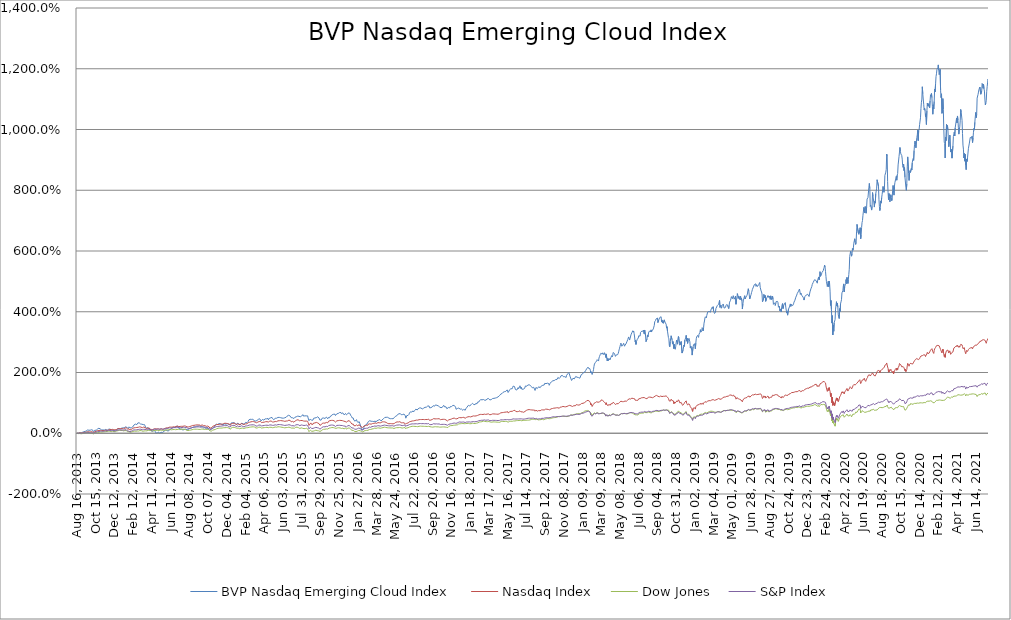
| Category | BVP Nasdaq Emerging Cloud Index | Nasdaq Index | Dow Jones | S&P Index |
|---|---|---|---|---|
| Aug 16, 2013 | 0 | 0 | 0 | 0 |
| Aug 19, 2013 | -0.007 | -0.004 | -0.005 | -0.006 |
| Aug 20, 2013 | 0.005 | 0.003 | -0.005 | -0.002 |
| Aug 21, 2013 | 0.004 | -0.001 | -0.012 | -0.008 |
| Aug 22, 2013 | 0.009 | 0.01 | -0.008 | 0.001 |
| Aug 23, 2013 | 0.012 | 0.015 | -0.005 | 0.005 |
| Aug 26, 2013 | 0.017 | 0.015 | -0.009 | 0.001 |
| Aug 27, 2013 | -0.004 | -0.007 | -0.02 | -0.015 |
| Aug 28, 2013 | -0.003 | -0.003 | -0.017 | -0.013 |
| Aug 29, 2013 | 0.009 | 0.005 | -0.016 | -0.011 |
| Aug 30, 2013 | 0.016 | -0.004 | -0.018 | -0.014 |
| Sep 03, 2013 | 0.029 | 0.003 | -0.016 | -0.01 |
| Sep 04, 2013 | 0.032 | 0.013 | -0.01 | -0.002 |
| Sep 05, 2013 | 0.032 | 0.016 | -0.01 | 0 |
| Sep 06, 2013 | 0.029 | 0.016 | -0.011 | 0 |
| Sep 09, 2013 | 0.05 | 0.029 | -0.001 | 0.01 |
| Sep 10, 2013 | 0.071 | 0.035 | 0.007 | 0.017 |
| Sep 11, 2013 | 0.068 | 0.034 | 0.016 | 0.02 |
| Sep 12, 2013 | 0.062 | 0.031 | 0.015 | 0.017 |
| Sep 13, 2013 | 0.07 | 0.033 | 0.02 | 0.019 |
| Sep 16, 2013 | 0.065 | 0.032 | 0.027 | 0.025 |
| Sep 17, 2013 | 0.078 | 0.04 | 0.03 | 0.03 |
| Sep 18, 2013 | 0.108 | 0.05 | 0.039 | 0.042 |
| Sep 19, 2013 | 0.112 | 0.052 | 0.037 | 0.04 |
| Sep 20, 2013 | 0.113 | 0.048 | 0.025 | 0.033 |
| Sep 23, 2013 | 0.106 | 0.045 | 0.021 | 0.028 |
| Sep 24, 2013 | 0.097 | 0.046 | 0.017 | 0.025 |
| Sep 25, 2013 | 0.093 | 0.044 | 0.013 | 0.022 |
| Sep 26, 2013 | 0.104 | 0.051 | 0.016 | 0.026 |
| Sep 27, 2013 | 0.101 | 0.05 | 0.012 | 0.022 |
| Sep 30, 2013 | 0.105 | 0.047 | 0.003 | 0.016 |
| Oct 01, 2013 | 0.119 | 0.06 | 0.007 | 0.024 |
| Oct 02, 2013 | 0.116 | 0.059 | 0.003 | 0.023 |
| Oct 03, 2013 | 0.098 | 0.048 | -0.006 | 0.014 |
| Oct 04, 2013 | 0.115 | 0.057 | -0.001 | 0.021 |
| Oct 07, 2013 | 0.096 | 0.047 | -0.01 | 0.012 |
| Oct 08, 2013 | 0.054 | 0.026 | -0.02 | 0 |
| Oct 09, 2013 | 0.046 | 0.021 | -0.018 | 0 |
| Oct 10, 2013 | 0.085 | 0.044 | 0.003 | 0.022 |
| Oct 11, 2013 | 0.098 | 0.052 | 0.01 | 0.029 |
| Oct 14, 2013 | 0.108 | 0.059 | 0.015 | 0.033 |
| Oct 15, 2013 | 0.087 | 0.053 | 0.006 | 0.026 |
| Oct 16, 2013 | 0.098 | 0.066 | 0.019 | 0.04 |
| Oct 17, 2013 | 0.106 | 0.072 | 0.019 | 0.047 |
| Oct 18, 2013 | 0.125 | 0.086 | 0.021 | 0.054 |
| Oct 21, 2013 | 0.14 | 0.088 | 0.021 | 0.054 |
| Oct 22, 2013 | 0.133 | 0.091 | 0.026 | 0.06 |
| Oct 23, 2013 | 0.122 | 0.084 | 0.022 | 0.055 |
| Oct 24, 2013 | 0.167 | 0.091 | 0.028 | 0.058 |
| Oct 25, 2013 | 0.163 | 0.095 | 0.032 | 0.063 |
| Oct 28, 2013 | 0.147 | 0.094 | 0.032 | 0.064 |
| Oct 29, 2013 | 0.142 | 0.097 | 0.04 | 0.07 |
| Oct 30, 2013 | 0.125 | 0.091 | 0.036 | 0.065 |
| Oct 31, 2013 | 0.136 | 0.088 | 0.031 | 0.061 |
| Nov 01, 2013 | 0.11 | 0.089 | 0.035 | 0.064 |
| Nov 04, 2013 | 0.121 | 0.093 | 0.037 | 0.068 |
| Nov 05, 2013 | 0.123 | 0.094 | 0.036 | 0.065 |
| Nov 06, 2013 | 0.107 | 0.091 | 0.044 | 0.069 |
| Nov 07, 2013 | 0.076 | 0.071 | 0.034 | 0.055 |
| Nov 08, 2013 | 0.108 | 0.088 | 0.045 | 0.069 |
| Nov 11, 2013 | 0.108 | 0.088 | 0.047 | 0.07 |
| Nov 12, 2013 | 0.124 | 0.088 | 0.044 | 0.068 |
| Nov 13, 2013 | 0.137 | 0.101 | 0.049 | 0.076 |
| Nov 14, 2013 | 0.125 | 0.103 | 0.053 | 0.081 |
| Nov 15, 2013 | 0.139 | 0.106 | 0.058 | 0.086 |
| Nov 18, 2013 | 0.114 | 0.096 | 0.059 | 0.082 |
| Nov 19, 2013 | 0.1 | 0.091 | 0.059 | 0.08 |
| Nov 20, 2013 | 0.097 | 0.088 | 0.054 | 0.076 |
| Nov 21, 2013 | 0.12 | 0.102 | 0.062 | 0.085 |
| Nov 22, 2013 | 0.13 | 0.108 | 0.065 | 0.09 |
| Nov 25, 2013 | 0.117 | 0.109 | 0.066 | 0.089 |
| Nov 26, 2013 | 0.139 | 0.115 | 0.066 | 0.089 |
| Nov 27, 2013 | 0.137 | 0.123 | 0.067 | 0.091 |
| Nov 29, 2013 | 0.134 | 0.127 | 0.067 | 0.091 |
| Dec 02, 2013 | 0.122 | 0.123 | 0.061 | 0.088 |
| Dec 03, 2013 | 0.113 | 0.121 | 0.055 | 0.084 |
| Dec 04, 2013 | 0.108 | 0.121 | 0.054 | 0.083 |
| Dec 05, 2013 | 0.111 | 0.119 | 0.049 | 0.078 |
| Dec 06, 2013 | 0.108 | 0.128 | 0.062 | 0.09 |
| Dec 09, 2013 | 0.106 | 0.129 | 0.063 | 0.092 |
| Dec 10, 2013 | 0.098 | 0.127 | 0.059 | 0.089 |
| Dec 11, 2013 | 0.074 | 0.111 | 0.051 | 0.076 |
| Dec 12, 2013 | 0.068 | 0.11 | 0.044 | 0.072 |
| Dec 13, 2013 | 0.096 | 0.111 | 0.045 | 0.072 |
| Dec 16, 2013 | 0.098 | 0.118 | 0.053 | 0.079 |
| Dec 17, 2013 | 0.102 | 0.117 | 0.053 | 0.076 |
| Dec 18, 2013 | 0.114 | 0.13 | 0.072 | 0.094 |
| Dec 19, 2013 | 0.108 | 0.126 | 0.073 | 0.093 |
| Dec 20, 2013 | 0.14 | 0.139 | 0.076 | 0.098 |
| Dec 23, 2013 | 0.151 | 0.152 | 0.08 | 0.104 |
| Dec 24, 2013 | 0.151 | 0.153 | 0.085 | 0.107 |
| Dec 26, 2013 | 0.15 | 0.157 | 0.093 | 0.112 |
| Dec 27, 2013 | 0.152 | 0.154 | 0.093 | 0.112 |
| Dec 30, 2013 | 0.158 | 0.153 | 0.094 | 0.112 |
| Dec 31, 2013 | 0.163 | 0.159 | 0.099 | 0.116 |
| Jan 02, 2014 | 0.144 | 0.15 | 0.09 | 0.106 |
| Jan 03, 2014 | 0.155 | 0.147 | 0.092 | 0.106 |
| Jan 06, 2014 | 0.148 | 0.142 | 0.089 | 0.103 |
| Jan 07, 2014 | 0.17 | 0.153 | 0.096 | 0.11 |
| Jan 08, 2014 | 0.179 | 0.156 | 0.092 | 0.11 |
| Jan 09, 2014 | 0.17 | 0.154 | 0.09 | 0.11 |
| Jan 10, 2014 | 0.175 | 0.159 | 0.09 | 0.113 |
| Jan 13, 2014 | 0.144 | 0.142 | 0.078 | 0.099 |
| Jan 14, 2014 | 0.165 | 0.161 | 0.086 | 0.111 |
| Jan 15, 2014 | 0.189 | 0.17 | 0.093 | 0.116 |
| Jan 16, 2014 | 0.204 | 0.171 | 0.089 | 0.115 |
| Jan 17, 2014 | 0.206 | 0.165 | 0.091 | 0.11 |
| Jan 21, 2014 | 0.213 | 0.173 | 0.088 | 0.114 |
| Jan 22, 2014 | 0.225 | 0.178 | 0.086 | 0.114 |
| Jan 23, 2014 | 0.216 | 0.171 | 0.074 | 0.104 |
| Jan 24, 2014 | 0.18 | 0.146 | 0.053 | 0.081 |
| Jan 27, 2014 | 0.162 | 0.133 | 0.05 | 0.076 |
| Jan 28, 2014 | 0.18 | 0.137 | 0.056 | 0.083 |
| Jan 29, 2014 | 0.161 | 0.125 | 0.044 | 0.071 |
| Jan 30, 2014 | 0.211 | 0.144 | 0.051 | 0.084 |
| Jan 31, 2014 | 0.217 | 0.139 | 0.041 | 0.077 |
| Feb 03, 2014 | 0.176 | 0.109 | 0.019 | 0.052 |
| Feb 04, 2014 | 0.181 | 0.119 | 0.024 | 0.06 |
| Feb 05, 2014 | 0.176 | 0.113 | 0.024 | 0.058 |
| Feb 06, 2014 | 0.179 | 0.126 | 0.036 | 0.071 |
| Feb 07, 2014 | 0.192 | 0.145 | 0.047 | 0.085 |
| Feb 10, 2014 | 0.198 | 0.151 | 0.048 | 0.087 |
| Feb 11, 2014 | 0.208 | 0.163 | 0.061 | 0.099 |
| Feb 12, 2014 | 0.216 | 0.166 | 0.059 | 0.099 |
| Feb 13, 2014 | 0.239 | 0.177 | 0.063 | 0.105 |
| Feb 14, 2014 | 0.277 | 0.178 | 0.071 | 0.11 |
| Feb 18, 2014 | 0.291 | 0.186 | 0.07 | 0.112 |
| Feb 19, 2014 | 0.282 | 0.176 | 0.064 | 0.104 |
| Feb 20, 2014 | 0.301 | 0.185 | 0.07 | 0.111 |
| Feb 21, 2014 | 0.313 | 0.183 | 0.068 | 0.109 |
| Feb 24, 2014 | 0.315 | 0.192 | 0.075 | 0.116 |
| Feb 25, 2014 | 0.284 | 0.19 | 0.073 | 0.114 |
| Feb 26, 2014 | 0.293 | 0.191 | 0.074 | 0.114 |
| Feb 27, 2014 | 0.336 | 0.199 | 0.079 | 0.12 |
| Feb 28, 2014 | 0.309 | 0.196 | 0.082 | 0.123 |
| Mar 03, 2014 | 0.304 | 0.187 | 0.072 | 0.115 |
| Mar 04, 2014 | 0.346 | 0.208 | 0.087 | 0.132 |
| Mar 05, 2014 | 0.34 | 0.21 | 0.085 | 0.132 |
| Mar 06, 2014 | 0.323 | 0.208 | 0.089 | 0.134 |
| Mar 07, 2014 | 0.305 | 0.204 | 0.091 | 0.134 |
| Mar 10, 2014 | 0.299 | 0.203 | 0.089 | 0.134 |
| Mar 11, 2014 | 0.286 | 0.196 | 0.084 | 0.128 |
| Mar 12, 2014 | 0.298 | 0.2 | 0.083 | 0.128 |
| Mar 13, 2014 | 0.274 | 0.183 | 0.068 | 0.115 |
| Mar 14, 2014 | 0.274 | 0.178 | 0.065 | 0.112 |
| Mar 17, 2014 | 0.285 | 0.188 | 0.077 | 0.123 |
| Mar 18, 2014 | 0.312 | 0.203 | 0.083 | 0.131 |
| Mar 19, 2014 | 0.287 | 0.196 | 0.076 | 0.124 |
| Mar 20, 2014 | 0.281 | 0.199 | 0.083 | 0.131 |
| Mar 21, 2014 | 0.243 | 0.187 | 0.081 | 0.127 |
| Mar 24, 2014 | 0.205 | 0.173 | 0.079 | 0.122 |
| Mar 25, 2014 | 0.194 | 0.175 | 0.085 | 0.127 |
| Mar 26, 2014 | 0.164 | 0.158 | 0.079 | 0.119 |
| Mar 27, 2014 | 0.171 | 0.152 | 0.078 | 0.117 |
| Mar 28, 2014 | 0.16 | 0.153 | 0.082 | 0.122 |
| Mar 31, 2014 | 0.189 | 0.165 | 0.091 | 0.131 |
| Apr 01, 2014 | 0.204 | 0.185 | 0.096 | 0.139 |
| Apr 02, 2014 | 0.19 | 0.187 | 0.099 | 0.142 |
| Apr 03, 2014 | 0.138 | 0.176 | 0.099 | 0.141 |
| Apr 04, 2014 | 0.102 | 0.146 | 0.088 | 0.126 |
| Apr 07, 2014 | 0.075 | 0.132 | 0.077 | 0.114 |
| Apr 08, 2014 | 0.095 | 0.142 | 0.078 | 0.118 |
| Apr 09, 2014 | 0.127 | 0.161 | 0.09 | 0.131 |
| Apr 10, 2014 | 0.07 | 0.125 | 0.072 | 0.107 |
| Apr 11, 2014 | 0.041 | 0.11 | 0.063 | 0.097 |
| Apr 14, 2014 | 0.045 | 0.117 | 0.072 | 0.106 |
| Apr 15, 2014 | 0.067 | 0.12 | 0.078 | 0.113 |
| Apr 16, 2014 | 0.083 | 0.134 | 0.089 | 0.125 |
| Apr 17, 2014 | 0.096 | 0.137 | 0.088 | 0.126 |
| Apr 21, 2014 | 0.094 | 0.144 | 0.091 | 0.13 |
| Apr 22, 2014 | 0.096 | 0.155 | 0.095 | 0.135 |
| Apr 23, 2014 | 0.075 | 0.145 | 0.094 | 0.133 |
| Apr 24, 2014 | 0.042 | 0.151 | 0.094 | 0.135 |
| Apr 25, 2014 | -0.003 | 0.131 | 0.085 | 0.125 |
| Apr 28, 2014 | -0.028 | 0.131 | 0.091 | 0.129 |
| Apr 29, 2014 | -0.003 | 0.139 | 0.096 | 0.134 |
| Apr 30, 2014 | 0.016 | 0.142 | 0.099 | 0.138 |
| May 01, 2014 | 0.031 | 0.146 | 0.098 | 0.138 |
| May 02, 2014 | 0.04 | 0.145 | 0.095 | 0.136 |
| May 05, 2014 | 0.041 | 0.149 | 0.096 | 0.138 |
| May 06, 2014 | 0.009 | 0.133 | 0.087 | 0.128 |
| May 07, 2014 | -0.021 | 0.129 | 0.095 | 0.134 |
| May 08, 2014 | -0.023 | 0.125 | 0.097 | 0.133 |
| May 09, 2014 | -0.002 | 0.13 | 0.1 | 0.134 |
| May 12, 2014 | 0.041 | 0.15 | 0.107 | 0.145 |
| May 13, 2014 | 0.026 | 0.146 | 0.108 | 0.146 |
| May 14, 2014 | 0.01 | 0.138 | 0.102 | 0.141 |
| May 15, 2014 | 0.009 | 0.129 | 0.091 | 0.13 |
| May 16, 2014 | 0.026 | 0.135 | 0.093 | 0.134 |
| May 19, 2014 | 0.053 | 0.145 | 0.095 | 0.138 |
| May 20, 2014 | 0.054 | 0.137 | 0.086 | 0.131 |
| May 21, 2014 | 0.055 | 0.147 | 0.096 | 0.14 |
| May 22, 2014 | 0.076 | 0.153 | 0.097 | 0.143 |
| May 23, 2014 | 0.094 | 0.162 | 0.101 | 0.148 |
| May 27, 2014 | 0.116 | 0.176 | 0.106 | 0.155 |
| May 28, 2014 | 0.108 | 0.173 | 0.103 | 0.153 |
| May 29, 2014 | 0.113 | 0.179 | 0.107 | 0.16 |
| May 30, 2014 | 0.089 | 0.178 | 0.108 | 0.162 |
| Jun 02, 2014 | 0.069 | 0.176 | 0.11 | 0.163 |
| Jun 03, 2014 | 0.066 | 0.175 | 0.109 | 0.162 |
| Jun 04, 2014 | 0.071 | 0.18 | 0.11 | 0.164 |
| Jun 05, 2014 | 0.101 | 0.192 | 0.116 | 0.172 |
| Jun 06, 2014 | 0.113 | 0.199 | 0.122 | 0.177 |
| Jun 09, 2014 | 0.115 | 0.204 | 0.123 | 0.178 |
| Jun 10, 2014 | 0.114 | 0.204 | 0.124 | 0.178 |
| Jun 11, 2014 | 0.124 | 0.202 | 0.117 | 0.174 |
| Jun 12, 2014 | 0.128 | 0.193 | 0.11 | 0.166 |
| Jun 13, 2014 | 0.141 | 0.196 | 0.112 | 0.169 |
| Jun 16, 2014 | 0.167 | 0.199 | 0.113 | 0.17 |
| Jun 17, 2014 | 0.18 | 0.204 | 0.115 | 0.173 |
| Jun 18, 2014 | 0.199 | 0.211 | 0.121 | 0.182 |
| Jun 19, 2014 | 0.197 | 0.21 | 0.122 | 0.183 |
| Jun 20, 2014 | 0.197 | 0.212 | 0.124 | 0.185 |
| Jun 23, 2014 | 0.2 | 0.213 | 0.123 | 0.185 |
| Jun 24, 2014 | 0.193 | 0.208 | 0.115 | 0.178 |
| Jun 25, 2014 | 0.199 | 0.216 | 0.118 | 0.183 |
| Jun 26, 2014 | 0.198 | 0.215 | 0.117 | 0.182 |
| Jun 27, 2014 | 0.209 | 0.221 | 0.117 | 0.184 |
| Jun 30, 2014 | 0.218 | 0.224 | 0.116 | 0.184 |
| Jul 01, 2014 | 0.244 | 0.238 | 0.124 | 0.192 |
| Jul 02, 2014 | 0.227 | 0.237 | 0.126 | 0.193 |
| Jul 03, 2014 | 0.226 | 0.245 | 0.132 | 0.199 |
| Jul 07, 2014 | 0.197 | 0.236 | 0.129 | 0.194 |
| Jul 08, 2014 | 0.158 | 0.219 | 0.121 | 0.186 |
| Jul 09, 2014 | 0.151 | 0.227 | 0.126 | 0.191 |
| Jul 10, 2014 | 0.145 | 0.22 | 0.122 | 0.187 |
| Jul 11, 2014 | 0.143 | 0.226 | 0.123 | 0.188 |
| Jul 14, 2014 | 0.152 | 0.232 | 0.131 | 0.194 |
| Jul 15, 2014 | 0.135 | 0.226 | 0.131 | 0.192 |
| Jul 16, 2014 | 0.135 | 0.228 | 0.136 | 0.197 |
| Jul 17, 2014 | 0.113 | 0.211 | 0.126 | 0.183 |
| Jul 18, 2014 | 0.106 | 0.23 | 0.134 | 0.195 |
| Jul 21, 2014 | 0.105 | 0.228 | 0.131 | 0.192 |
| Jul 22, 2014 | 0.115 | 0.237 | 0.135 | 0.198 |
| Jul 23, 2014 | 0.111 | 0.242 | 0.133 | 0.2 |
| Jul 24, 2014 | 0.126 | 0.241 | 0.133 | 0.201 |
| Jul 25, 2014 | 0.131 | 0.235 | 0.125 | 0.195 |
| Jul 28, 2014 | 0.118 | 0.234 | 0.126 | 0.195 |
| Jul 29, 2014 | 0.137 | 0.233 | 0.121 | 0.19 |
| Jul 30, 2014 | 0.163 | 0.239 | 0.119 | 0.19 |
| Jul 31, 2014 | 0.123 | 0.213 | 0.098 | 0.166 |
| Aug 01, 2014 | 0.109 | 0.208 | 0.094 | 0.163 |
| Aug 04, 2014 | 0.133 | 0.217 | 0.099 | 0.171 |
| Aug 05, 2014 | 0.128 | 0.208 | 0.089 | 0.16 |
| Aug 06, 2014 | 0.128 | 0.209 | 0.09 | 0.16 |
| Aug 07, 2014 | 0.128 | 0.203 | 0.085 | 0.153 |
| Aug 08, 2014 | 0.137 | 0.213 | 0.098 | 0.167 |
| Aug 11, 2014 | 0.158 | 0.222 | 0.099 | 0.17 |
| Aug 12, 2014 | 0.157 | 0.218 | 0.098 | 0.168 |
| Aug 13, 2014 | 0.173 | 0.231 | 0.104 | 0.176 |
| Aug 14, 2014 | 0.17 | 0.236 | 0.108 | 0.181 |
| Aug 15, 2014 | 0.161 | 0.239 | 0.105 | 0.181 |
| Aug 18, 2014 | 0.181 | 0.251 | 0.117 | 0.191 |
| Aug 19, 2014 | 0.189 | 0.257 | 0.122 | 0.197 |
| Aug 20, 2014 | 0.176 | 0.256 | 0.126 | 0.2 |
| Aug 21, 2014 | 0.182 | 0.258 | 0.13 | 0.203 |
| Aug 22, 2014 | 0.2 | 0.26 | 0.127 | 0.201 |
| Aug 25, 2014 | 0.195 | 0.265 | 0.132 | 0.207 |
| Aug 26, 2014 | 0.213 | 0.269 | 0.134 | 0.208 |
| Aug 27, 2014 | 0.206 | 0.268 | 0.135 | 0.208 |
| Aug 28, 2014 | 0.189 | 0.265 | 0.132 | 0.206 |
| Aug 29, 2014 | 0.233 | 0.271 | 0.134 | 0.21 |
| Sep 02, 2014 | 0.235 | 0.276 | 0.132 | 0.209 |
| Sep 03, 2014 | 0.223 | 0.269 | 0.132 | 0.208 |
| Sep 04, 2014 | 0.227 | 0.266 | 0.132 | 0.206 |
| Sep 05, 2014 | 0.23 | 0.272 | 0.136 | 0.213 |
| Sep 08, 2014 | 0.251 | 0.275 | 0.135 | 0.209 |
| Sep 09, 2014 | 0.228 | 0.264 | 0.128 | 0.201 |
| Sep 10, 2014 | 0.246 | 0.273 | 0.132 | 0.205 |
| Sep 11, 2014 | 0.261 | 0.275 | 0.13 | 0.206 |
| Sep 12, 2014 | 0.246 | 0.268 | 0.126 | 0.199 |
| Sep 15, 2014 | 0.208 | 0.254 | 0.129 | 0.198 |
| Sep 16, 2014 | 0.207 | 0.264 | 0.136 | 0.207 |
| Sep 17, 2014 | 0.207 | 0.266 | 0.138 | 0.209 |
| Sep 18, 2014 | 0.216 | 0.275 | 0.145 | 0.215 |
| Sep 19, 2014 | 0.213 | 0.271 | 0.146 | 0.214 |
| Sep 22, 2014 | 0.191 | 0.257 | 0.139 | 0.204 |
| Sep 23, 2014 | 0.176 | 0.251 | 0.131 | 0.197 |
| Sep 24, 2014 | 0.198 | 0.264 | 0.141 | 0.207 |
| Sep 25, 2014 | 0.17 | 0.24 | 0.124 | 0.187 |
| Sep 26, 2014 | 0.181 | 0.252 | 0.135 | 0.197 |
| Sep 29, 2014 | 0.191 | 0.251 | 0.132 | 0.194 |
| Sep 30, 2014 | 0.178 | 0.247 | 0.13 | 0.191 |
| Oct 01, 2014 | 0.156 | 0.227 | 0.114 | 0.175 |
| Oct 02, 2014 | 0.174 | 0.23 | 0.114 | 0.175 |
| Oct 03, 2014 | 0.202 | 0.242 | 0.128 | 0.188 |
| Oct 06, 2014 | 0.181 | 0.236 | 0.127 | 0.187 |
| Oct 07, 2014 | 0.146 | 0.217 | 0.109 | 0.169 |
| Oct 08, 2014 | 0.173 | 0.24 | 0.127 | 0.189 |
| Oct 09, 2014 | 0.141 | 0.215 | 0.105 | 0.164 |
| Oct 10, 2014 | 0.107 | 0.187 | 0.097 | 0.151 |
| Oct 13, 2014 | 0.091 | 0.17 | 0.082 | 0.132 |
| Oct 14, 2014 | 0.103 | 0.173 | 0.082 | 0.134 |
| Oct 15, 2014 | 0.129 | 0.17 | 0.07 | 0.125 |
| Oct 16, 2014 | 0.147 | 0.171 | 0.069 | 0.125 |
| Oct 17, 2014 | 0.156 | 0.182 | 0.086 | 0.139 |
| Oct 20, 2014 | 0.164 | 0.198 | 0.087 | 0.15 |
| Oct 21, 2014 | 0.181 | 0.227 | 0.102 | 0.172 |
| Oct 22, 2014 | 0.152 | 0.217 | 0.091 | 0.164 |
| Oct 23, 2014 | 0.188 | 0.236 | 0.106 | 0.178 |
| Oct 24, 2014 | 0.218 | 0.245 | 0.114 | 0.186 |
| Oct 27, 2014 | 0.217 | 0.245 | 0.115 | 0.185 |
| Oct 28, 2014 | 0.249 | 0.267 | 0.128 | 0.199 |
| Oct 29, 2014 | 0.238 | 0.263 | 0.126 | 0.197 |
| Oct 30, 2014 | 0.258 | 0.267 | 0.14 | 0.205 |
| Oct 31, 2014 | 0.303 | 0.285 | 0.153 | 0.219 |
| Nov 03, 2014 | 0.295 | 0.288 | 0.151 | 0.219 |
| Nov 04, 2014 | 0.296 | 0.283 | 0.153 | 0.215 |
| Nov 05, 2014 | 0.289 | 0.283 | 0.159 | 0.222 |
| Nov 06, 2014 | 0.296 | 0.287 | 0.164 | 0.227 |
| Nov 07, 2014 | 0.312 | 0.286 | 0.165 | 0.227 |
| Nov 10, 2014 | 0.318 | 0.291 | 0.168 | 0.231 |
| Nov 11, 2014 | 0.324 | 0.294 | 0.168 | 0.232 |
| Nov 12, 2014 | 0.326 | 0.298 | 0.168 | 0.231 |
| Nov 13, 2014 | 0.313 | 0.299 | 0.17 | 0.232 |
| Nov 14, 2014 | 0.317 | 0.301 | 0.169 | 0.232 |
| Nov 17, 2014 | 0.291 | 0.296 | 0.17 | 0.233 |
| Nov 18, 2014 | 0.29 | 0.305 | 0.173 | 0.239 |
| Nov 19, 2014 | 0.268 | 0.298 | 0.173 | 0.237 |
| Nov 20, 2014 | 0.276 | 0.305 | 0.175 | 0.24 |
| Nov 21, 2014 | 0.28 | 0.308 | 0.181 | 0.246 |
| Nov 24, 2014 | 0.292 | 0.32 | 0.181 | 0.25 |
| Nov 25, 2014 | 0.288 | 0.321 | 0.181 | 0.248 |
| Nov 26, 2014 | 0.309 | 0.329 | 0.182 | 0.252 |
| Nov 28, 2014 | 0.305 | 0.33 | 0.182 | 0.249 |
| Dec 01, 2014 | 0.286 | 0.312 | 0.179 | 0.24 |
| Dec 02, 2014 | 0.299 | 0.32 | 0.186 | 0.248 |
| Dec 03, 2014 | 0.301 | 0.325 | 0.188 | 0.253 |
| Dec 04, 2014 | 0.309 | 0.324 | 0.187 | 0.251 |
| Dec 05, 2014 | 0.319 | 0.327 | 0.191 | 0.253 |
| Dec 08, 2014 | 0.296 | 0.316 | 0.184 | 0.244 |
| Dec 09, 2014 | 0.315 | 0.323 | 0.18 | 0.244 |
| Dec 10, 2014 | 0.287 | 0.3 | 0.163 | 0.224 |
| Dec 11, 2014 | 0.288 | 0.307 | 0.167 | 0.229 |
| Dec 12, 2014 | 0.286 | 0.292 | 0.146 | 0.209 |
| Dec 15, 2014 | 0.278 | 0.278 | 0.139 | 0.202 |
| Dec 16, 2014 | 0.259 | 0.262 | 0.132 | 0.191 |
| Dec 17, 2014 | 0.3 | 0.289 | 0.151 | 0.216 |
| Dec 18, 2014 | 0.342 | 0.318 | 0.179 | 0.245 |
| Dec 19, 2014 | 0.346 | 0.323 | 0.181 | 0.251 |
| Dec 22, 2014 | 0.347 | 0.327 | 0.191 | 0.255 |
| Dec 23, 2014 | 0.348 | 0.323 | 0.195 | 0.257 |
| Dec 24, 2014 | 0.352 | 0.325 | 0.196 | 0.257 |
| Dec 26, 2014 | 0.357 | 0.334 | 0.197 | 0.261 |
| Dec 29, 2014 | 0.346 | 0.334 | 0.196 | 0.263 |
| Dec 30, 2014 | 0.329 | 0.326 | 0.192 | 0.256 |
| Dec 31, 2014 | 0.327 | 0.315 | 0.182 | 0.243 |
| Jan 02, 2015 | 0.313 | 0.312 | 0.182 | 0.243 |
| Jan 05, 2015 | 0.299 | 0.291 | 0.16 | 0.22 |
| Jan 06, 2015 | 0.285 | 0.275 | 0.152 | 0.209 |
| Jan 07, 2015 | 0.291 | 0.291 | 0.166 | 0.223 |
| Jan 08, 2015 | 0.33 | 0.315 | 0.187 | 0.245 |
| Jan 09, 2015 | 0.324 | 0.306 | 0.176 | 0.235 |
| Jan 12, 2015 | 0.318 | 0.295 | 0.17 | 0.225 |
| Jan 13, 2015 | 0.32 | 0.294 | 0.168 | 0.222 |
| Jan 14, 2015 | 0.304 | 0.288 | 0.156 | 0.215 |
| Jan 15, 2015 | 0.275 | 0.269 | 0.148 | 0.203 |
| Jan 16, 2015 | 0.296 | 0.286 | 0.161 | 0.22 |
| Jan 20, 2015 | 0.295 | 0.292 | 0.161 | 0.221 |
| Jan 21, 2015 | 0.297 | 0.296 | 0.164 | 0.227 |
| Jan 22, 2015 | 0.318 | 0.319 | 0.181 | 0.246 |
| Jan 23, 2015 | 0.337 | 0.321 | 0.172 | 0.239 |
| Jan 26, 2015 | 0.341 | 0.324 | 0.172 | 0.242 |
| Jan 27, 2015 | 0.32 | 0.299 | 0.153 | 0.226 |
| Jan 28, 2015 | 0.301 | 0.287 | 0.14 | 0.209 |
| Jan 29, 2015 | 0.321 | 0.3 | 0.155 | 0.221 |
| Jan 30, 2015 | 0.297 | 0.287 | 0.138 | 0.205 |
| Feb 02, 2015 | 0.318 | 0.298 | 0.151 | 0.22 |
| Feb 03, 2015 | 0.339 | 0.312 | 0.171 | 0.238 |
| Feb 04, 2015 | 0.357 | 0.309 | 0.172 | 0.233 |
| Feb 05, 2015 | 0.367 | 0.323 | 0.186 | 0.246 |
| Feb 06, 2015 | 0.363 | 0.317 | 0.182 | 0.241 |
| Feb 09, 2015 | 0.347 | 0.312 | 0.176 | 0.236 |
| Feb 10, 2015 | 0.372 | 0.329 | 0.185 | 0.249 |
| Feb 11, 2015 | 0.375 | 0.333 | 0.184 | 0.249 |
| Feb 12, 2015 | 0.393 | 0.348 | 0.192 | 0.261 |
| Feb 13, 2015 | 0.436 | 0.358 | 0.195 | 0.266 |
| Feb 17, 2015 | 0.437 | 0.36 | 0.197 | 0.268 |
| Feb 18, 2015 | 0.449 | 0.362 | 0.195 | 0.268 |
| Feb 19, 2015 | 0.46 | 0.367 | 0.193 | 0.267 |
| Feb 20, 2015 | 0.472 | 0.376 | 0.203 | 0.274 |
| Feb 23, 2015 | 0.452 | 0.377 | 0.201 | 0.274 |
| Feb 24, 2015 | 0.456 | 0.379 | 0.207 | 0.278 |
| Feb 25, 2015 | 0.46 | 0.379 | 0.208 | 0.277 |
| Feb 26, 2015 | 0.474 | 0.384 | 0.208 | 0.275 |
| Feb 27, 2015 | 0.459 | 0.378 | 0.202 | 0.271 |
| Mar 02, 2015 | 0.47 | 0.39 | 0.213 | 0.279 |
| Mar 03, 2015 | 0.454 | 0.382 | 0.207 | 0.273 |
| Mar 04, 2015 | 0.417 | 0.379 | 0.2 | 0.267 |
| Mar 05, 2015 | 0.429 | 0.383 | 0.203 | 0.269 |
| Mar 06, 2015 | 0.404 | 0.368 | 0.184 | 0.251 |
| Mar 09, 2015 | 0.403 | 0.372 | 0.193 | 0.256 |
| Mar 10, 2015 | 0.382 | 0.349 | 0.171 | 0.235 |
| Mar 11, 2015 | 0.397 | 0.346 | 0.169 | 0.232 |
| Mar 12, 2015 | 0.418 | 0.358 | 0.187 | 0.248 |
| Mar 13, 2015 | 0.413 | 0.352 | 0.177 | 0.24 |
| Mar 16, 2015 | 0.435 | 0.368 | 0.192 | 0.257 |
| Mar 17, 2015 | 0.457 | 0.37 | 0.184 | 0.253 |
| Mar 18, 2015 | 0.473 | 0.383 | 0.199 | 0.268 |
| Mar 19, 2015 | 0.484 | 0.386 | 0.191 | 0.262 |
| Mar 20, 2015 | 0.477 | 0.395 | 0.202 | 0.273 |
| Mar 23, 2015 | 0.468 | 0.391 | 0.201 | 0.271 |
| Mar 24, 2015 | 0.458 | 0.386 | 0.194 | 0.263 |
| Mar 25, 2015 | 0.407 | 0.354 | 0.175 | 0.245 |
| Mar 26, 2015 | 0.421 | 0.35 | 0.172 | 0.242 |
| Mar 27, 2015 | 0.436 | 0.358 | 0.174 | 0.245 |
| Mar 30, 2015 | 0.453 | 0.373 | 0.192 | 0.26 |
| Mar 31, 2015 | 0.439 | 0.36 | 0.179 | 0.249 |
| Apr 01, 2015 | 0.429 | 0.355 | 0.174 | 0.244 |
| Apr 02, 2015 | 0.435 | 0.356 | 0.178 | 0.248 |
| Apr 06, 2015 | 0.455 | 0.365 | 0.186 | 0.257 |
| Apr 07, 2015 | 0.453 | 0.363 | 0.185 | 0.254 |
| Apr 08, 2015 | 0.473 | 0.374 | 0.187 | 0.257 |
| Apr 09, 2015 | 0.469 | 0.381 | 0.191 | 0.263 |
| Apr 10, 2015 | 0.485 | 0.387 | 0.197 | 0.269 |
| Apr 13, 2015 | 0.474 | 0.385 | 0.192 | 0.264 |
| Apr 14, 2015 | 0.461 | 0.382 | 0.196 | 0.266 |
| Apr 15, 2015 | 0.483 | 0.391 | 0.201 | 0.272 |
| Apr 16, 2015 | 0.491 | 0.39 | 0.201 | 0.271 |
| Apr 17, 2015 | 0.442 | 0.369 | 0.182 | 0.257 |
| Apr 20, 2015 | 0.468 | 0.386 | 0.196 | 0.268 |
| Apr 21, 2015 | 0.489 | 0.392 | 0.19 | 0.267 |
| Apr 22, 2015 | 0.49 | 0.398 | 0.196 | 0.273 |
| Apr 23, 2015 | 0.517 | 0.403 | 0.197 | 0.276 |
| Apr 24, 2015 | 0.508 | 0.413 | 0.199 | 0.279 |
| Apr 27, 2015 | 0.497 | 0.405 | 0.196 | 0.274 |
| Apr 28, 2015 | 0.5 | 0.403 | 0.201 | 0.277 |
| Apr 29, 2015 | 0.521 | 0.394 | 0.196 | 0.272 |
| Apr 30, 2015 | 0.484 | 0.372 | 0.183 | 0.26 |
| May 01, 2015 | 0.502 | 0.389 | 0.195 | 0.273 |
| May 04, 2015 | 0.513 | 0.393 | 0.198 | 0.277 |
| May 05, 2015 | 0.447 | 0.371 | 0.189 | 0.262 |
| May 06, 2015 | 0.463 | 0.366 | 0.183 | 0.256 |
| May 07, 2015 | 0.478 | 0.373 | 0.188 | 0.261 |
| May 08, 2015 | 0.491 | 0.389 | 0.206 | 0.278 |
| May 11, 2015 | 0.499 | 0.386 | 0.2 | 0.271 |
| May 12, 2015 | 0.497 | 0.381 | 0.198 | 0.268 |
| May 13, 2015 | 0.495 | 0.383 | 0.198 | 0.267 |
| May 14, 2015 | 0.519 | 0.402 | 0.21 | 0.281 |
| May 15, 2015 | 0.496 | 0.401 | 0.212 | 0.282 |
| May 18, 2015 | 0.521 | 0.41 | 0.213 | 0.286 |
| May 19, 2015 | 0.517 | 0.407 | 0.214 | 0.285 |
| May 20, 2015 | 0.518 | 0.408 | 0.212 | 0.284 |
| May 21, 2015 | 0.522 | 0.413 | 0.212 | 0.287 |
| May 22, 2015 | 0.52 | 0.413 | 0.209 | 0.284 |
| May 26, 2015 | 0.507 | 0.397 | 0.196 | 0.271 |
| May 27, 2015 | 0.512 | 0.417 | 0.204 | 0.282 |
| May 28, 2015 | 0.517 | 0.415 | 0.202 | 0.281 |
| May 29, 2015 | 0.501 | 0.407 | 0.194 | 0.273 |
| Jun 01, 2015 | 0.499 | 0.411 | 0.196 | 0.275 |
| Jun 02, 2015 | 0.492 | 0.409 | 0.194 | 0.274 |
| Jun 03, 2015 | 0.513 | 0.415 | 0.199 | 0.277 |
| Jun 04, 2015 | 0.496 | 0.404 | 0.187 | 0.266 |
| Jun 05, 2015 | 0.523 | 0.407 | 0.184 | 0.264 |
| Jun 08, 2015 | 0.509 | 0.394 | 0.178 | 0.256 |
| Jun 09, 2015 | 0.509 | 0.392 | 0.178 | 0.256 |
| Jun 10, 2015 | 0.525 | 0.409 | 0.194 | 0.271 |
| Jun 11, 2015 | 0.524 | 0.411 | 0.196 | 0.274 |
| Jun 12, 2015 | 0.527 | 0.402 | 0.187 | 0.265 |
| Jun 15, 2015 | 0.541 | 0.396 | 0.18 | 0.259 |
| Jun 16, 2015 | 0.563 | 0.403 | 0.187 | 0.266 |
| Jun 17, 2015 | 0.57 | 0.406 | 0.189 | 0.269 |
| Jun 18, 2015 | 0.595 | 0.425 | 0.201 | 0.281 |
| Jun 19, 2015 | 0.591 | 0.42 | 0.195 | 0.274 |
| Jun 22, 2015 | 0.599 | 0.431 | 0.201 | 0.282 |
| Jun 23, 2015 | 0.608 | 0.432 | 0.203 | 0.283 |
| Jun 24, 2015 | 0.577 | 0.422 | 0.191 | 0.273 |
| Jun 25, 2015 | 0.588 | 0.419 | 0.186 | 0.27 |
| Jun 26, 2015 | 0.561 | 0.41 | 0.19 | 0.269 |
| Jun 29, 2015 | 0.513 | 0.376 | 0.167 | 0.243 |
| Jun 30, 2015 | 0.524 | 0.384 | 0.168 | 0.246 |
| Jul 01, 2015 | 0.527 | 0.391 | 0.177 | 0.255 |
| Jul 02, 2015 | 0.509 | 0.39 | 0.176 | 0.254 |
| Jul 06, 2015 | 0.503 | 0.386 | 0.173 | 0.249 |
| Jul 07, 2015 | 0.501 | 0.387 | 0.179 | 0.257 |
| Jul 08, 2015 | 0.485 | 0.363 | 0.161 | 0.236 |
| Jul 09, 2015 | 0.505 | 0.366 | 0.164 | 0.239 |
| Jul 10, 2015 | 0.524 | 0.387 | 0.178 | 0.254 |
| Jul 13, 2015 | 0.528 | 0.408 | 0.192 | 0.268 |
| Jul 14, 2015 | 0.546 | 0.417 | 0.197 | 0.274 |
| Jul 15, 2015 | 0.542 | 0.415 | 0.197 | 0.273 |
| Jul 16, 2015 | 0.562 | 0.433 | 0.201 | 0.283 |
| Jul 17, 2015 | 0.552 | 0.446 | 0.199 | 0.284 |
| Jul 20, 2015 | 0.562 | 0.449 | 0.2 | 0.285 |
| Jul 21, 2015 | 0.558 | 0.446 | 0.188 | 0.28 |
| Jul 22, 2015 | 0.556 | 0.435 | 0.184 | 0.277 |
| Jul 23, 2015 | 0.558 | 0.428 | 0.176 | 0.27 |
| Jul 24, 2015 | 0.562 | 0.412 | 0.165 | 0.256 |
| Jul 27, 2015 | 0.526 | 0.399 | 0.156 | 0.249 |
| Jul 28, 2015 | 0.542 | 0.413 | 0.169 | 0.264 |
| Jul 29, 2015 | 0.542 | 0.419 | 0.177 | 0.273 |
| Jul 30, 2015 | 0.545 | 0.424 | 0.177 | 0.273 |
| Jul 31, 2015 | 0.574 | 0.423 | 0.173 | 0.271 |
| Aug 03, 2015 | 0.563 | 0.42 | 0.167 | 0.267 |
| Aug 04, 2015 | 0.568 | 0.417 | 0.164 | 0.264 |
| Aug 05, 2015 | 0.611 | 0.427 | 0.163 | 0.268 |
| Aug 06, 2015 | 0.565 | 0.403 | 0.155 | 0.258 |
| Aug 07, 2015 | 0.56 | 0.4 | 0.152 | 0.255 |
| Aug 10, 2015 | 0.585 | 0.416 | 0.168 | 0.271 |
| Aug 11, 2015 | 0.573 | 0.398 | 0.154 | 0.259 |
| Aug 12, 2015 | 0.567 | 0.4 | 0.154 | 0.26 |
| Aug 13, 2015 | 0.566 | 0.397 | 0.154 | 0.258 |
| Aug 14, 2015 | 0.572 | 0.401 | 0.159 | 0.263 |
| Aug 17, 2015 | 0.604 | 0.413 | 0.163 | 0.27 |
| Aug 18, 2015 | 0.578 | 0.404 | 0.161 | 0.266 |
| Aug 19, 2015 | 0.572 | 0.393 | 0.15 | 0.256 |
| Aug 20, 2015 | 0.505 | 0.354 | 0.127 | 0.229 |
| Aug 21, 2015 | 0.476 | 0.306 | 0.091 | 0.19 |
| Aug 24, 2015 | 0.414 | 0.256 | 0.052 | 0.143 |
| Aug 25, 2015 | 0.413 | 0.251 | 0.039 | 0.128 |
| Aug 26, 2015 | 0.445 | 0.304 | 0.08 | 0.172 |
| Aug 27, 2015 | 0.47 | 0.336 | 0.104 | 0.2 |
| Aug 28, 2015 | 0.485 | 0.34 | 0.104 | 0.201 |
| Aug 31, 2015 | 0.465 | 0.326 | 0.096 | 0.191 |
| Sep 01, 2015 | 0.421 | 0.287 | 0.065 | 0.156 |
| Sep 02, 2015 | 0.449 | 0.318 | 0.084 | 0.177 |
| Sep 03, 2015 | 0.451 | 0.314 | 0.086 | 0.178 |
| Sep 04, 2015 | 0.44 | 0.3 | 0.068 | 0.16 |
| Sep 08, 2015 | 0.491 | 0.336 | 0.094 | 0.189 |
| Sep 09, 2015 | 0.477 | 0.32 | 0.078 | 0.173 |
| Sep 10, 2015 | 0.49 | 0.331 | 0.083 | 0.179 |
| Sep 11, 2015 | 0.503 | 0.339 | 0.09 | 0.184 |
| Sep 14, 2015 | 0.495 | 0.334 | 0.086 | 0.179 |
| Sep 15, 2015 | 0.512 | 0.349 | 0.101 | 0.195 |
| Sep 16, 2015 | 0.514 | 0.357 | 0.11 | 0.205 |
| Sep 17, 2015 | 0.53 | 0.358 | 0.106 | 0.202 |
| Sep 18, 2015 | 0.532 | 0.34 | 0.086 | 0.183 |
| Sep 21, 2015 | 0.541 | 0.34 | 0.095 | 0.188 |
| Sep 22, 2015 | 0.521 | 0.32 | 0.083 | 0.173 |
| Sep 23, 2015 | 0.524 | 0.319 | 0.079 | 0.171 |
| Sep 24, 2015 | 0.501 | 0.314 | 0.074 | 0.167 |
| Sep 25, 2015 | 0.476 | 0.301 | 0.082 | 0.166 |
| Sep 28, 2015 | 0.43 | 0.261 | 0.061 | 0.136 |
| Sep 29, 2015 | 0.423 | 0.254 | 0.064 | 0.138 |
| Sep 30, 2015 | 0.445 | 0.282 | 0.08 | 0.16 |
| Oct 01, 2015 | 0.441 | 0.284 | 0.079 | 0.162 |
| Oct 02, 2015 | 0.472 | 0.307 | 0.092 | 0.178 |
| Oct 05, 2015 | 0.499 | 0.327 | 0.112 | 0.2 |
| Oct 06, 2015 | 0.483 | 0.318 | 0.113 | 0.196 |
| Oct 07, 2015 | 0.501 | 0.33 | 0.121 | 0.205 |
| Oct 08, 2015 | 0.503 | 0.335 | 0.131 | 0.216 |
| Oct 09, 2015 | 0.513 | 0.341 | 0.133 | 0.217 |
| Oct 12, 2015 | 0.51 | 0.343 | 0.136 | 0.218 |
| Oct 13, 2015 | 0.487 | 0.331 | 0.133 | 0.21 |
| Oct 14, 2015 | 0.469 | 0.328 | 0.122 | 0.204 |
| Oct 15, 2015 | 0.506 | 0.352 | 0.137 | 0.222 |
| Oct 16, 2015 | 0.531 | 0.356 | 0.142 | 0.228 |
| Oct 19, 2015 | 0.527 | 0.362 | 0.142 | 0.228 |
| Oct 20, 2015 | 0.512 | 0.355 | 0.142 | 0.226 |
| Oct 21, 2015 | 0.476 | 0.343 | 0.138 | 0.219 |
| Oct 22, 2015 | 0.515 | 0.366 | 0.16 | 0.24 |
| Oct 23, 2015 | 0.526 | 0.397 | 0.17 | 0.253 |
| Oct 26, 2015 | 0.527 | 0.397 | 0.169 | 0.251 |
| Oct 27, 2015 | 0.511 | 0.396 | 0.166 | 0.248 |
| Oct 28, 2015 | 0.551 | 0.414 | 0.179 | 0.262 |
| Oct 29, 2015 | 0.54 | 0.408 | 0.177 | 0.262 |
| Oct 30, 2015 | 0.55 | 0.403 | 0.171 | 0.256 |
| Nov 02, 2015 | 0.571 | 0.423 | 0.182 | 0.271 |
| Nov 03, 2015 | 0.577 | 0.428 | 0.188 | 0.274 |
| Nov 04, 2015 | 0.615 | 0.427 | 0.185 | 0.27 |
| Nov 05, 2015 | 0.603 | 0.423 | 0.184 | 0.268 |
| Nov 06, 2015 | 0.634 | 0.429 | 0.188 | 0.268 |
| Nov 09, 2015 | 0.626 | 0.414 | 0.176 | 0.255 |
| Nov 10, 2015 | 0.621 | 0.411 | 0.177 | 0.257 |
| Nov 11, 2015 | 0.628 | 0.406 | 0.174 | 0.253 |
| Nov 12, 2015 | 0.627 | 0.389 | 0.157 | 0.236 |
| Nov 13, 2015 | 0.584 | 0.368 | 0.143 | 0.222 |
| Nov 16, 2015 | 0.598 | 0.384 | 0.159 | 0.24 |
| Nov 17, 2015 | 0.613 | 0.384 | 0.16 | 0.238 |
| Nov 18, 2015 | 0.641 | 0.409 | 0.176 | 0.258 |
| Nov 19, 2015 | 0.663 | 0.408 | 0.176 | 0.257 |
| Nov 20, 2015 | 0.657 | 0.417 | 0.182 | 0.262 |
| Nov 23, 2015 | 0.65 | 0.416 | 0.18 | 0.26 |
| Nov 24, 2015 | 0.667 | 0.416 | 0.181 | 0.262 |
| Nov 25, 2015 | 0.681 | 0.42 | 0.181 | 0.262 |
| Nov 27, 2015 | 0.683 | 0.423 | 0.18 | 0.262 |
| Nov 30, 2015 | 0.677 | 0.418 | 0.175 | 0.256 |
| Dec 01, 2015 | 0.682 | 0.431 | 0.186 | 0.27 |
| Dec 02, 2015 | 0.682 | 0.422 | 0.176 | 0.256 |
| Dec 03, 2015 | 0.647 | 0.398 | 0.159 | 0.238 |
| Dec 04, 2015 | 0.679 | 0.427 | 0.183 | 0.263 |
| Dec 07, 2015 | 0.658 | 0.416 | 0.176 | 0.254 |
| Dec 08, 2015 | 0.671 | 0.415 | 0.165 | 0.246 |
| Dec 09, 2015 | 0.646 | 0.394 | 0.16 | 0.237 |
| Dec 10, 2015 | 0.643 | 0.4 | 0.165 | 0.239 |
| Dec 11, 2015 | 0.605 | 0.369 | 0.145 | 0.215 |
| Dec 14, 2015 | 0.6 | 0.375 | 0.152 | 0.221 |
| Dec 15, 2015 | 0.622 | 0.387 | 0.162 | 0.234 |
| Dec 16, 2015 | 0.652 | 0.408 | 0.177 | 0.252 |
| Dec 17, 2015 | 0.637 | 0.389 | 0.16 | 0.233 |
| Dec 18, 2015 | 0.605 | 0.366 | 0.136 | 0.211 |
| Dec 21, 2015 | 0.622 | 0.379 | 0.144 | 0.221 |
| Dec 22, 2015 | 0.637 | 0.388 | 0.155 | 0.231 |
| Dec 23, 2015 | 0.65 | 0.401 | 0.167 | 0.247 |
| Dec 24, 2015 | 0.653 | 0.401 | 0.164 | 0.245 |
| Dec 28, 2015 | 0.656 | 0.399 | 0.162 | 0.242 |
| Dec 29, 2015 | 0.673 | 0.418 | 0.175 | 0.255 |
| Dec 30, 2015 | 0.66 | 0.406 | 0.167 | 0.246 |
| Dec 31, 2015 | 0.636 | 0.39 | 0.155 | 0.234 |
| Jan 04, 2016 | 0.594 | 0.361 | 0.137 | 0.216 |
| Jan 05, 2016 | 0.577 | 0.358 | 0.138 | 0.218 |
| Jan 06, 2016 | 0.556 | 0.342 | 0.121 | 0.202 |
| Jan 07, 2016 | 0.512 | 0.302 | 0.095 | 0.173 |
| Jan 08, 2016 | 0.486 | 0.289 | 0.084 | 0.161 |
| Jan 11, 2016 | 0.484 | 0.287 | 0.087 | 0.162 |
| Jan 12, 2016 | 0.5 | 0.301 | 0.095 | 0.171 |
| Jan 13, 2016 | 0.434 | 0.256 | 0.071 | 0.142 |
| Jan 14, 2016 | 0.46 | 0.281 | 0.086 | 0.161 |
| Jan 15, 2016 | 0.43 | 0.246 | 0.06 | 0.136 |
| Jan 19, 2016 | 0.396 | 0.243 | 0.062 | 0.136 |
| Jan 20, 2016 | 0.399 | 0.241 | 0.045 | 0.123 |
| Jan 21, 2016 | 0.405 | 0.241 | 0.053 | 0.129 |
| Jan 22, 2016 | 0.449 | 0.274 | 0.067 | 0.152 |
| Jan 25, 2016 | 0.399 | 0.254 | 0.053 | 0.134 |
| Jan 26, 2016 | 0.399 | 0.268 | 0.072 | 0.15 |
| Jan 27, 2016 | 0.355 | 0.24 | 0.057 | 0.137 |
| Jan 28, 2016 | 0.327 | 0.251 | 0.066 | 0.143 |
| Jan 29, 2016 | 0.359 | 0.281 | 0.092 | 0.172 |
| Feb 01, 2016 | 0.379 | 0.282 | 0.091 | 0.171 |
| Feb 02, 2016 | 0.333 | 0.254 | 0.071 | 0.149 |
| Feb 03, 2016 | 0.343 | 0.25 | 0.083 | 0.155 |
| Feb 04, 2016 | 0.351 | 0.252 | 0.089 | 0.157 |
| Feb 05, 2016 | 0.2 | 0.211 | 0.074 | 0.135 |
| Feb 08, 2016 | 0.105 | 0.189 | 0.063 | 0.119 |
| Feb 09, 2016 | 0.072 | 0.185 | 0.062 | 0.119 |
| Feb 10, 2016 | 0.102 | 0.189 | 0.055 | 0.118 |
| Feb 11, 2016 | 0.125 | 0.184 | 0.038 | 0.105 |
| Feb 12, 2016 | 0.148 | 0.204 | 0.059 | 0.126 |
| Feb 16, 2016 | 0.189 | 0.231 | 0.074 | 0.145 |
| Feb 17, 2016 | 0.243 | 0.258 | 0.091 | 0.164 |
| Feb 18, 2016 | 0.225 | 0.246 | 0.088 | 0.158 |
| Feb 19, 2016 | 0.246 | 0.25 | 0.087 | 0.158 |
| Feb 22, 2016 | 0.273 | 0.269 | 0.102 | 0.175 |
| Feb 23, 2016 | 0.252 | 0.25 | 0.09 | 0.16 |
| Feb 24, 2016 | 0.28 | 0.261 | 0.093 | 0.165 |
| Feb 25, 2016 | 0.305 | 0.272 | 0.107 | 0.179 |
| Feb 26, 2016 | 0.334 | 0.274 | 0.103 | 0.176 |
| Feb 29, 2016 | 0.333 | 0.265 | 0.095 | 0.167 |
| Mar 01, 2016 | 0.385 | 0.302 | 0.118 | 0.195 |
| Mar 02, 2016 | 0.396 | 0.305 | 0.121 | 0.2 |
| Mar 03, 2016 | 0.407 | 0.307 | 0.123 | 0.204 |
| Mar 04, 2016 | 0.413 | 0.309 | 0.128 | 0.208 |
| Mar 07, 2016 | 0.419 | 0.307 | 0.132 | 0.209 |
| Mar 08, 2016 | 0.393 | 0.29 | 0.125 | 0.195 |
| Mar 09, 2016 | 0.395 | 0.297 | 0.127 | 0.201 |
| Mar 10, 2016 | 0.367 | 0.294 | 0.127 | 0.202 |
| Mar 11, 2016 | 0.392 | 0.318 | 0.141 | 0.221 |
| Mar 14, 2016 | 0.392 | 0.319 | 0.142 | 0.22 |
| Mar 15, 2016 | 0.363 | 0.313 | 0.144 | 0.217 |
| Mar 16, 2016 | 0.378 | 0.322 | 0.149 | 0.224 |
| Mar 17, 2016 | 0.386 | 0.325 | 0.159 | 0.232 |
| Mar 18, 2016 | 0.407 | 0.331 | 0.167 | 0.238 |
| Mar 21, 2016 | 0.403 | 0.335 | 0.169 | 0.239 |
| Mar 22, 2016 | 0.401 | 0.338 | 0.166 | 0.238 |
| Mar 23, 2016 | 0.367 | 0.324 | 0.161 | 0.23 |
| Mar 24, 2016 | 0.369 | 0.325 | 0.161 | 0.23 |
| Mar 28, 2016 | 0.373 | 0.323 | 0.163 | 0.23 |
| Mar 29, 2016 | 0.41 | 0.345 | 0.169 | 0.241 |
| Mar 30, 2016 | 0.418 | 0.352 | 0.175 | 0.246 |
| Mar 31, 2016 | 0.424 | 0.352 | 0.173 | 0.244 |
| Apr 01, 2016 | 0.432 | 0.364 | 0.18 | 0.252 |
| Apr 04, 2016 | 0.442 | 0.358 | 0.176 | 0.248 |
| Apr 05, 2016 | 0.426 | 0.344 | 0.167 | 0.235 |
| Apr 06, 2016 | 0.452 | 0.366 | 0.175 | 0.248 |
| Apr 07, 2016 | 0.429 | 0.346 | 0.163 | 0.233 |
| Apr 08, 2016 | 0.426 | 0.346 | 0.165 | 0.237 |
| Apr 11, 2016 | 0.405 | 0.342 | 0.164 | 0.233 |
| Apr 12, 2016 | 0.398 | 0.352 | 0.175 | 0.245 |
| Apr 13, 2016 | 0.441 | 0.373 | 0.187 | 0.258 |
| Apr 14, 2016 | 0.44 | 0.373 | 0.189 | 0.258 |
| Apr 15, 2016 | 0.447 | 0.371 | 0.187 | 0.257 |
| Apr 18, 2016 | 0.475 | 0.377 | 0.194 | 0.265 |
| Apr 19, 2016 | 0.473 | 0.371 | 0.197 | 0.269 |
| Apr 20, 2016 | 0.486 | 0.373 | 0.2 | 0.27 |
| Apr 21, 2016 | 0.521 | 0.373 | 0.192 | 0.263 |
| Apr 22, 2016 | 0.528 | 0.362 | 0.194 | 0.263 |
| Apr 25, 2016 | 0.517 | 0.359 | 0.192 | 0.261 |
| Apr 26, 2016 | 0.524 | 0.357 | 0.193 | 0.263 |
| Apr 27, 2016 | 0.534 | 0.35 | 0.196 | 0.265 |
| Apr 28, 2016 | 0.53 | 0.334 | 0.182 | 0.254 |
| Apr 29, 2016 | 0.526 | 0.325 | 0.179 | 0.247 |
| May 02, 2016 | 0.546 | 0.337 | 0.186 | 0.257 |
| May 03, 2016 | 0.511 | 0.322 | 0.177 | 0.246 |
| May 04, 2016 | 0.498 | 0.312 | 0.17 | 0.239 |
| May 05, 2016 | 0.484 | 0.309 | 0.171 | 0.238 |
| May 06, 2016 | 0.47 | 0.315 | 0.176 | 0.242 |
| May 09, 2016 | 0.479 | 0.318 | 0.174 | 0.243 |
| May 10, 2016 | 0.497 | 0.335 | 0.189 | 0.259 |
| May 11, 2016 | 0.491 | 0.321 | 0.174 | 0.247 |
| May 12, 2016 | 0.481 | 0.315 | 0.175 | 0.247 |
| May 13, 2016 | 0.478 | 0.309 | 0.163 | 0.236 |
| May 16, 2016 | 0.499 | 0.325 | 0.174 | 0.248 |
| May 17, 2016 | 0.478 | 0.309 | 0.162 | 0.236 |
| May 18, 2016 | 0.497 | 0.315 | 0.162 | 0.237 |
| May 19, 2016 | 0.488 | 0.308 | 0.156 | 0.232 |
| May 20, 2016 | 0.516 | 0.324 | 0.16 | 0.239 |
| May 23, 2016 | 0.523 | 0.323 | 0.16 | 0.237 |
| May 24, 2016 | 0.553 | 0.349 | 0.174 | 0.254 |
| May 25, 2016 | 0.552 | 0.359 | 0.184 | 0.263 |
| May 26, 2016 | 0.555 | 0.361 | 0.182 | 0.262 |
| May 27, 2016 | 0.573 | 0.369 | 0.185 | 0.268 |
| May 31, 2016 | 0.588 | 0.373 | 0.179 | 0.266 |
| Jun 01, 2016 | 0.617 | 0.375 | 0.18 | 0.268 |
| Jun 02, 2016 | 0.628 | 0.38 | 0.183 | 0.271 |
| Jun 03, 2016 | 0.627 | 0.372 | 0.181 | 0.268 |
| Jun 06, 2016 | 0.641 | 0.379 | 0.188 | 0.274 |
| Jun 07, 2016 | 0.651 | 0.377 | 0.189 | 0.276 |
| Jun 08, 2016 | 0.663 | 0.381 | 0.194 | 0.28 |
| Jun 09, 2016 | 0.647 | 0.376 | 0.193 | 0.278 |
| Jun 10, 2016 | 0.614 | 0.359 | 0.185 | 0.266 |
| Jun 13, 2016 | 0.609 | 0.346 | 0.176 | 0.256 |
| Jun 14, 2016 | 0.618 | 0.344 | 0.172 | 0.253 |
| Jun 15, 2016 | 0.622 | 0.342 | 0.17 | 0.251 |
| Jun 16, 2016 | 0.616 | 0.345 | 0.176 | 0.255 |
| Jun 17, 2016 | 0.599 | 0.332 | 0.172 | 0.251 |
| Jun 20, 2016 | 0.629 | 0.343 | 0.181 | 0.258 |
| Jun 21, 2016 | 0.632 | 0.344 | 0.182 | 0.262 |
| Jun 22, 2016 | 0.608 | 0.342 | 0.179 | 0.259 |
| Jun 23, 2016 | 0.652 | 0.363 | 0.194 | 0.276 |
| Jun 24, 2016 | 0.572 | 0.307 | 0.154 | 0.23 |
| Jun 27, 2016 | 0.496 | 0.275 | 0.137 | 0.208 |
| Jun 28, 2016 | 0.532 | 0.302 | 0.154 | 0.23 |
| Jun 29, 2016 | 0.58 | 0.327 | 0.173 | 0.251 |
| Jun 30, 2016 | 0.6 | 0.344 | 0.189 | 0.268 |
| Jul 01, 2016 | 0.607 | 0.35 | 0.19 | 0.27 |
| Jul 05, 2016 | 0.588 | 0.339 | 0.183 | 0.261 |
| Jul 06, 2016 | 0.598 | 0.349 | 0.188 | 0.268 |
| Jul 07, 2016 | 0.622 | 0.354 | 0.187 | 0.267 |
| Jul 08, 2016 | 0.664 | 0.376 | 0.203 | 0.286 |
| Jul 11, 2016 | 0.69 | 0.385 | 0.209 | 0.291 |
| Jul 12, 2016 | 0.705 | 0.394 | 0.217 | 0.3 |
| Jul 13, 2016 | 0.692 | 0.389 | 0.218 | 0.3 |
| Jul 14, 2016 | 0.702 | 0.397 | 0.227 | 0.307 |
| Jul 15, 2016 | 0.7 | 0.396 | 0.228 | 0.306 |
| Jul 18, 2016 | 0.702 | 0.403 | 0.229 | 0.309 |
| Jul 19, 2016 | 0.697 | 0.398 | 0.231 | 0.307 |
| Jul 20, 2016 | 0.737 | 0.413 | 0.233 | 0.312 |
| Jul 21, 2016 | 0.703 | 0.408 | 0.228 | 0.308 |
| Jul 22, 2016 | 0.736 | 0.416 | 0.231 | 0.314 |
| Jul 25, 2016 | 0.741 | 0.415 | 0.226 | 0.31 |
| Jul 26, 2016 | 0.753 | 0.418 | 0.225 | 0.31 |
| Jul 27, 2016 | 0.77 | 0.427 | 0.225 | 0.308 |
| Jul 28, 2016 | 0.794 | 0.431 | 0.224 | 0.311 |
| Jul 29, 2016 | 0.789 | 0.433 | 0.222 | 0.313 |
| Aug 01, 2016 | 0.791 | 0.439 | 0.22 | 0.311 |
| Aug 02, 2016 | 0.765 | 0.426 | 0.214 | 0.303 |
| Aug 03, 2016 | 0.785 | 0.432 | 0.217 | 0.307 |
| Aug 04, 2016 | 0.808 | 0.434 | 0.217 | 0.307 |
| Aug 05, 2016 | 0.832 | 0.449 | 0.23 | 0.318 |
| Aug 08, 2016 | 0.826 | 0.447 | 0.229 | 0.317 |
| Aug 09, 2016 | 0.832 | 0.45 | 0.229 | 0.318 |
| Aug 10, 2016 | 0.825 | 0.445 | 0.226 | 0.314 |
| Aug 11, 2016 | 0.838 | 0.451 | 0.234 | 0.32 |
| Aug 12, 2016 | 0.834 | 0.452 | 0.232 | 0.319 |
| Aug 15, 2016 | 0.841 | 0.461 | 0.236 | 0.323 |
| Aug 16, 2016 | 0.821 | 0.451 | 0.23 | 0.315 |
| Aug 17, 2016 | 0.8 | 0.451 | 0.232 | 0.318 |
| Aug 18, 2016 | 0.817 | 0.454 | 0.233 | 0.321 |
| Aug 19, 2016 | 0.828 | 0.454 | 0.23 | 0.319 |
| Aug 22, 2016 | 0.825 | 0.456 | 0.229 | 0.318 |
| Aug 23, 2016 | 0.855 | 0.46 | 0.23 | 0.321 |
| Aug 24, 2016 | 0.841 | 0.448 | 0.225 | 0.314 |
| Aug 25, 2016 | 0.854 | 0.447 | 0.223 | 0.312 |
| Aug 26, 2016 | 0.858 | 0.449 | 0.22 | 0.31 |
| Aug 29, 2016 | 0.856 | 0.452 | 0.227 | 0.317 |
| Aug 30, 2016 | 0.858 | 0.45 | 0.224 | 0.314 |
| Aug 31, 2016 | 0.864 | 0.447 | 0.22 | 0.311 |
| Sep 01, 2016 | 0.874 | 0.451 | 0.221 | 0.311 |
| Sep 02, 2016 | 0.897 | 0.457 | 0.226 | 0.317 |
| Sep 06, 2016 | 0.908 | 0.464 | 0.229 | 0.32 |
| Sep 07, 2016 | 0.91 | 0.467 | 0.228 | 0.32 |
| Sep 08, 2016 | 0.897 | 0.46 | 0.225 | 0.317 |
| Sep 09, 2016 | 0.838 | 0.423 | 0.199 | 0.285 |
| Sep 12, 2016 | 0.861 | 0.447 | 0.215 | 0.304 |
| Sep 13, 2016 | 0.83 | 0.431 | 0.198 | 0.285 |
| Sep 14, 2016 | 0.842 | 0.436 | 0.196 | 0.284 |
| Sep 15, 2016 | 0.873 | 0.457 | 0.208 | 0.297 |
| Sep 16, 2016 | 0.873 | 0.456 | 0.202 | 0.292 |
| Sep 19, 2016 | 0.869 | 0.453 | 0.201 | 0.292 |
| Sep 20, 2016 | 0.868 | 0.455 | 0.202 | 0.292 |
| Sep 21, 2016 | 0.907 | 0.47 | 0.213 | 0.306 |
| Sep 22, 2016 | 0.925 | 0.482 | 0.22 | 0.315 |
| Sep 23, 2016 | 0.903 | 0.473 | 0.211 | 0.307 |
| Sep 26, 2016 | 0.891 | 0.459 | 0.2 | 0.296 |
| Sep 27, 2016 | 0.919 | 0.473 | 0.209 | 0.304 |
| Sep 28, 2016 | 0.933 | 0.476 | 0.216 | 0.311 |
| Sep 29, 2016 | 0.911 | 0.463 | 0.203 | 0.299 |
| Sep 30, 2016 | 0.925 | 0.474 | 0.214 | 0.309 |
| Oct 03, 2016 | 0.92 | 0.471 | 0.21 | 0.305 |
| Oct 04, 2016 | 0.921 | 0.468 | 0.205 | 0.299 |
| Oct 05, 2016 | 0.91 | 0.476 | 0.212 | 0.304 |
| Oct 06, 2016 | 0.902 | 0.473 | 0.211 | 0.305 |
| Oct 07, 2016 | 0.893 | 0.469 | 0.209 | 0.301 |
| Oct 10, 2016 | 0.91 | 0.479 | 0.215 | 0.307 |
| Oct 11, 2016 | 0.866 | 0.456 | 0.202 | 0.29 |
| Oct 12, 2016 | 0.856 | 0.454 | 0.203 | 0.292 |
| Oct 13, 2016 | 0.838 | 0.447 | 0.2 | 0.288 |
| Oct 14, 2016 | 0.84 | 0.447 | 0.203 | 0.288 |
| Oct 17, 2016 | 0.829 | 0.443 | 0.199 | 0.284 |
| Oct 18, 2016 | 0.842 | 0.455 | 0.204 | 0.292 |
| Oct 19, 2016 | 0.856 | 0.456 | 0.207 | 0.295 |
| Oct 20, 2016 | 0.851 | 0.455 | 0.204 | 0.293 |
| Oct 21, 2016 | 0.884 | 0.459 | 0.203 | 0.293 |
| Oct 24, 2016 | 0.919 | 0.474 | 0.208 | 0.299 |
| Oct 25, 2016 | 0.895 | 0.466 | 0.205 | 0.294 |
| Oct 26, 2016 | 0.868 | 0.457 | 0.207 | 0.292 |
| Oct 27, 2016 | 0.843 | 0.448 | 0.205 | 0.288 |
| Oct 28, 2016 | 0.861 | 0.441 | 0.204 | 0.284 |
| Oct 31, 2016 | 0.87 | 0.44 | 0.203 | 0.284 |
| Nov 01, 2016 | 0.856 | 0.43 | 0.196 | 0.275 |
| Nov 02, 2016 | 0.805 | 0.417 | 0.191 | 0.267 |
| Nov 03, 2016 | 0.793 | 0.404 | 0.189 | 0.261 |
| Nov 04, 2016 | 0.792 | 0.401 | 0.186 | 0.259 |
| Nov 07, 2016 | 0.847 | 0.434 | 0.211 | 0.287 |
| Nov 08, 2016 | 0.851 | 0.442 | 0.216 | 0.292 |
| Nov 09, 2016 | 0.852 | 0.458 | 0.233 | 0.306 |
| Nov 10, 2016 | 0.836 | 0.446 | 0.247 | 0.309 |
| Nov 11, 2016 | 0.872 | 0.454 | 0.25 | 0.307 |
| Nov 14, 2016 | 0.84 | 0.448 | 0.251 | 0.307 |
| Nov 15, 2016 | 0.861 | 0.464 | 0.255 | 0.317 |
| Nov 16, 2016 | 0.878 | 0.47 | 0.251 | 0.315 |
| Nov 17, 2016 | 0.902 | 0.481 | 0.253 | 0.321 |
| Nov 18, 2016 | 0.909 | 0.477 | 0.251 | 0.318 |
| Nov 21, 2016 | 0.916 | 0.49 | 0.257 | 0.328 |
| Nov 22, 2016 | 0.901 | 0.495 | 0.261 | 0.33 |
| Nov 23, 2016 | 0.912 | 0.493 | 0.265 | 0.331 |
| Nov 25, 2016 | 0.916 | 0.499 | 0.27 | 0.337 |
| Nov 28, 2016 | 0.894 | 0.49 | 0.266 | 0.33 |
| Nov 29, 2016 | 0.888 | 0.493 | 0.268 | 0.331 |
| Nov 30, 2016 | 0.86 | 0.478 | 0.268 | 0.328 |
| Dec 01, 2016 | 0.789 | 0.458 | 0.273 | 0.323 |
| Dec 02, 2016 | 0.773 | 0.459 | 0.271 | 0.324 |
| Dec 05, 2016 | 0.807 | 0.474 | 0.274 | 0.331 |
| Dec 06, 2016 | 0.815 | 0.48 | 0.277 | 0.336 |
| Dec 07, 2016 | 0.829 | 0.497 | 0.296 | 0.354 |
| Dec 08, 2016 | 0.848 | 0.504 | 0.301 | 0.357 |
| Dec 09, 2016 | 0.829 | 0.511 | 0.31 | 0.365 |
| Dec 12, 2016 | 0.806 | 0.502 | 0.313 | 0.363 |
| Dec 13, 2016 | 0.817 | 0.517 | 0.32 | 0.372 |
| Dec 14, 2016 | 0.794 | 0.509 | 0.312 | 0.361 |
| Dec 15, 2016 | 0.795 | 0.515 | 0.316 | 0.366 |
| Dec 16, 2016 | 0.792 | 0.509 | 0.316 | 0.364 |
| Dec 19, 2016 | 0.797 | 0.515 | 0.318 | 0.366 |
| Dec 20, 2016 | 0.807 | 0.522 | 0.324 | 0.371 |
| Dec 21, 2016 | 0.785 | 0.519 | 0.322 | 0.368 |
| Dec 22, 2016 | 0.754 | 0.512 | 0.321 | 0.365 |
| Dec 23, 2016 | 0.768 | 0.516 | 0.322 | 0.367 |
| Dec 27, 2016 | 0.788 | 0.523 | 0.322 | 0.37 |
| Dec 28, 2016 | 0.764 | 0.51 | 0.315 | 0.359 |
| Dec 29, 2016 | 0.768 | 0.508 | 0.314 | 0.358 |
| Dec 30, 2016 | 0.758 | 0.494 | 0.31 | 0.352 |
| Jan 03, 2017 | 0.785 | 0.507 | 0.318 | 0.364 |
| Jan 04, 2017 | 0.821 | 0.52 | 0.322 | 0.371 |
| Jan 05, 2017 | 0.833 | 0.523 | 0.319 | 0.37 |
| Jan 06, 2017 | 0.859 | 0.532 | 0.324 | 0.375 |
| Jan 09, 2017 | 0.878 | 0.535 | 0.319 | 0.37 |
| Jan 10, 2017 | 0.887 | 0.541 | 0.317 | 0.37 |
| Jan 11, 2017 | 0.919 | 0.544 | 0.323 | 0.374 |
| Jan 12, 2017 | 0.906 | 0.54 | 0.319 | 0.371 |
| Jan 13, 2017 | 0.931 | 0.547 | 0.319 | 0.374 |
| Jan 17, 2017 | 0.901 | 0.537 | 0.315 | 0.37 |
| Jan 18, 2017 | 0.919 | 0.542 | 0.313 | 0.372 |
| Jan 19, 2017 | 0.924 | 0.538 | 0.308 | 0.367 |
| Jan 20, 2017 | 0.941 | 0.542 | 0.315 | 0.372 |
| Jan 23, 2017 | 0.936 | 0.541 | 0.313 | 0.368 |
| Jan 24, 2017 | 0.955 | 0.555 | 0.32 | 0.377 |
| Jan 25, 2017 | 0.986 | 0.57 | 0.331 | 0.388 |
| Jan 26, 2017 | 0.962 | 0.57 | 0.333 | 0.387 |
| Jan 27, 2017 | 0.965 | 0.571 | 0.332 | 0.386 |
| Jan 30, 2017 | 0.943 | 0.558 | 0.324 | 0.377 |
| Jan 31, 2017 | 0.947 | 0.558 | 0.317 | 0.376 |
| Feb 01, 2017 | 0.941 | 0.566 | 0.319 | 0.377 |
| Feb 02, 2017 | 0.946 | 0.564 | 0.318 | 0.377 |
| Feb 03, 2017 | 0.979 | 0.573 | 0.331 | 0.387 |
| Feb 06, 2017 | 0.971 | 0.572 | 0.33 | 0.385 |
| Feb 07, 2017 | 0.978 | 0.575 | 0.332 | 0.385 |
| Feb 08, 2017 | 0.971 | 0.577 | 0.33 | 0.386 |
| Feb 09, 2017 | 1.024 | 0.586 | 0.338 | 0.394 |
| Feb 10, 2017 | 1.035 | 0.592 | 0.344 | 0.399 |
| Feb 13, 2017 | 1.033 | 0.6 | 0.353 | 0.406 |
| Feb 14, 2017 | 1.029 | 0.605 | 0.36 | 0.412 |
| Feb 15, 2017 | 1.07 | 0.615 | 0.367 | 0.419 |
| Feb 16, 2017 | 1.065 | 0.614 | 0.367 | 0.418 |
| Feb 17, 2017 | 1.087 | 0.621 | 0.368 | 0.42 |
| Feb 21, 2017 | 1.105 | 0.628 | 0.375 | 0.429 |
| Feb 22, 2017 | 1.102 | 0.627 | 0.378 | 0.427 |
| Feb 23, 2017 | 1.094 | 0.62 | 0.38 | 0.428 |
| Feb 24, 2017 | 1.102 | 0.622 | 0.381 | 0.43 |
| Feb 27, 2017 | 1.107 | 0.627 | 0.382 | 0.431 |
| Feb 28, 2017 | 1.07 | 0.617 | 0.38 | 0.427 |
| Mar 01, 2017 | 1.111 | 0.639 | 0.4 | 0.447 |
| Mar 02, 2017 | 1.086 | 0.627 | 0.393 | 0.439 |
| Mar 03, 2017 | 1.092 | 0.63 | 0.393 | 0.439 |
| Mar 06, 2017 | 1.086 | 0.624 | 0.389 | 0.435 |
| Mar 07, 2017 | 1.086 | 0.619 | 0.387 | 0.43 |
| Mar 08, 2017 | 1.087 | 0.62 | 0.383 | 0.427 |
| Mar 09, 2017 | 1.093 | 0.621 | 0.383 | 0.428 |
| Mar 10, 2017 | 1.105 | 0.627 | 0.386 | 0.433 |
| Mar 13, 2017 | 1.13 | 0.631 | 0.385 | 0.433 |
| Mar 14, 2017 | 1.107 | 0.626 | 0.382 | 0.429 |
| Mar 15, 2017 | 1.129 | 0.638 | 0.389 | 0.441 |
| Mar 16, 2017 | 1.145 | 0.638 | 0.388 | 0.438 |
| Mar 17, 2017 | 1.153 | 0.638 | 0.387 | 0.436 |
| Mar 20, 2017 | 1.157 | 0.638 | 0.386 | 0.433 |
| Mar 21, 2017 | 1.097 | 0.608 | 0.37 | 0.416 |
| Mar 22, 2017 | 1.095 | 0.616 | 0.37 | 0.418 |
| Mar 23, 2017 | 1.094 | 0.615 | 0.37 | 0.417 |
| Mar 24, 2017 | 1.107 | 0.618 | 0.366 | 0.416 |
| Mar 27, 2017 | 1.126 | 0.621 | 0.363 | 0.414 |
| Mar 28, 2017 | 1.136 | 0.631 | 0.373 | 0.424 |
| Mar 29, 2017 | 1.143 | 0.637 | 0.37 | 0.426 |
| Mar 30, 2017 | 1.13 | 0.642 | 0.374 | 0.43 |
| Mar 31, 2017 | 1.143 | 0.641 | 0.37 | 0.427 |
| Apr 03, 2017 | 1.149 | 0.636 | 0.369 | 0.425 |
| Apr 04, 2017 | 1.138 | 0.637 | 0.372 | 0.425 |
| Apr 05, 2017 | 1.141 | 0.628 | 0.369 | 0.421 |
| Apr 06, 2017 | 1.159 | 0.632 | 0.37 | 0.424 |
| Apr 07, 2017 | 1.165 | 0.631 | 0.37 | 0.423 |
| Apr 10, 2017 | 1.162 | 0.632 | 0.37 | 0.424 |
| Apr 11, 2017 | 1.172 | 0.628 | 0.369 | 0.422 |
| Apr 12, 2017 | 1.177 | 0.62 | 0.365 | 0.416 |
| Apr 13, 2017 | 1.175 | 0.611 | 0.356 | 0.407 |
| Apr 17, 2017 | 1.197 | 0.626 | 0.368 | 0.419 |
| Apr 18, 2017 | 1.2 | 0.624 | 0.361 | 0.415 |
| Apr 19, 2017 | 1.221 | 0.627 | 0.353 | 0.412 |
| Apr 20, 2017 | 1.236 | 0.642 | 0.365 | 0.423 |
| Apr 21, 2017 | 1.238 | 0.641 | 0.362 | 0.418 |
| Apr 24, 2017 | 1.261 | 0.661 | 0.377 | 0.434 |
| Apr 25, 2017 | 1.29 | 0.672 | 0.392 | 0.443 |
| Apr 26, 2017 | 1.282 | 0.672 | 0.391 | 0.442 |
| Apr 27, 2017 | 1.309 | 0.679 | 0.391 | 0.443 |
| Apr 28, 2017 | 1.311 | 0.679 | 0.388 | 0.44 |
| May 01, 2017 | 1.341 | 0.691 | 0.387 | 0.442 |
| May 02, 2017 | 1.348 | 0.692 | 0.389 | 0.444 |
| May 03, 2017 | 1.33 | 0.686 | 0.39 | 0.442 |
| May 04, 2017 | 1.361 | 0.686 | 0.389 | 0.443 |
| May 05, 2017 | 1.369 | 0.693 | 0.393 | 0.449 |
| May 08, 2017 | 1.349 | 0.694 | 0.393 | 0.449 |
| May 09, 2017 | 1.353 | 0.699 | 0.391 | 0.448 |
| May 10, 2017 | 1.379 | 0.701 | 0.389 | 0.449 |
| May 11, 2017 | 1.38 | 0.698 | 0.387 | 0.446 |
| May 12, 2017 | 1.396 | 0.699 | 0.386 | 0.444 |
| May 15, 2017 | 1.428 | 0.707 | 0.391 | 0.451 |
| May 16, 2017 | 1.436 | 0.713 | 0.391 | 0.45 |
| May 17, 2017 | 1.342 | 0.668 | 0.366 | 0.423 |
| May 18, 2017 | 1.365 | 0.681 | 0.37 | 0.429 |
| May 19, 2017 | 1.39 | 0.689 | 0.379 | 0.438 |
| May 22, 2017 | 1.429 | 0.702 | 0.385 | 0.446 |
| May 23, 2017 | 1.426 | 0.704 | 0.388 | 0.448 |
| May 24, 2017 | 1.447 | 0.711 | 0.393 | 0.452 |
| May 25, 2017 | 1.465 | 0.722 | 0.398 | 0.459 |
| May 26, 2017 | 1.485 | 0.724 | 0.398 | 0.459 |
| May 30, 2017 | 1.468 | 0.722 | 0.394 | 0.457 |
| May 31, 2017 | 1.467 | 0.72 | 0.393 | 0.457 |
| Jun 01, 2017 | 1.514 | 0.734 | 0.402 | 0.468 |
| Jun 02, 2017 | 1.551 | 0.75 | 0.406 | 0.473 |
| Jun 05, 2017 | 1.542 | 0.747 | 0.405 | 0.471 |
| Jun 06, 2017 | 1.544 | 0.742 | 0.401 | 0.467 |
| Jun 07, 2017 | 1.538 | 0.748 | 0.404 | 0.469 |
| Jun 08, 2017 | 1.565 | 0.755 | 0.405 | 0.47 |
| Jun 09, 2017 | 1.44 | 0.723 | 0.41 | 0.469 |
| Jun 12, 2017 | 1.416 | 0.714 | 0.408 | 0.467 |
| Jun 13, 2017 | 1.436 | 0.727 | 0.414 | 0.474 |
| Jun 14, 2017 | 1.422 | 0.719 | 0.417 | 0.472 |
| Jun 15, 2017 | 1.428 | 0.711 | 0.416 | 0.469 |
| Jun 16, 2017 | 1.449 | 0.708 | 0.418 | 0.469 |
| Jun 19, 2017 | 1.503 | 0.732 | 0.428 | 0.482 |
| Jun 20, 2017 | 1.466 | 0.718 | 0.423 | 0.472 |
| Jun 21, 2017 | 1.495 | 0.73 | 0.42 | 0.471 |
| Jun 22, 2017 | 1.521 | 0.731 | 0.419 | 0.47 |
| Jun 23, 2017 | 1.563 | 0.739 | 0.419 | 0.473 |
| Jun 26, 2017 | 1.525 | 0.734 | 0.42 | 0.473 |
| Jun 27, 2017 | 1.468 | 0.706 | 0.413 | 0.461 |
| Jun 28, 2017 | 1.515 | 0.73 | 0.423 | 0.474 |
| Jun 29, 2017 | 1.45 | 0.705 | 0.411 | 0.461 |
| Jun 30, 2017 | 1.458 | 0.704 | 0.416 | 0.464 |
| Jul 03, 2017 | 1.421 | 0.696 | 0.424 | 0.467 |
| Jul 05, 2017 | 1.45 | 0.707 | 0.424 | 0.469 |
| Jul 06, 2017 | 1.419 | 0.69 | 0.414 | 0.455 |
| Jul 07, 2017 | 1.471 | 0.708 | 0.42 | 0.465 |
| Jul 10, 2017 | 1.475 | 0.714 | 0.42 | 0.466 |
| Jul 11, 2017 | 1.504 | 0.719 | 0.42 | 0.465 |
| Jul 12, 2017 | 1.558 | 0.738 | 0.428 | 0.476 |
| Jul 13, 2017 | 1.539 | 0.742 | 0.429 | 0.478 |
| Jul 14, 2017 | 1.551 | 0.752 | 0.435 | 0.485 |
| Jul 17, 2017 | 1.549 | 0.753 | 0.434 | 0.485 |
| Jul 18, 2017 | 1.562 | 0.761 | 0.431 | 0.486 |
| Jul 19, 2017 | 1.585 | 0.772 | 0.435 | 0.494 |
| Jul 20, 2017 | 1.577 | 0.774 | 0.433 | 0.494 |
| Jul 21, 2017 | 1.562 | 0.773 | 0.431 | 0.493 |
| Jul 24, 2017 | 1.597 | 0.779 | 0.426 | 0.492 |
| Jul 25, 2017 | 1.606 | 0.78 | 0.433 | 0.496 |
| Jul 26, 2017 | 1.62 | 0.783 | 0.44 | 0.496 |
| Jul 27, 2017 | 1.571 | 0.771 | 0.445 | 0.495 |
| Jul 28, 2017 | 1.557 | 0.769 | 0.447 | 0.493 |
| Jul 31, 2017 | 1.534 | 0.762 | 0.452 | 0.492 |
| Aug 01, 2017 | 1.565 | 0.766 | 0.456 | 0.496 |
| Aug 02, 2017 | 1.495 | 0.766 | 0.46 | 0.496 |
| Aug 03, 2017 | 1.511 | 0.76 | 0.46 | 0.493 |
| Aug 04, 2017 | 1.5 | 0.763 | 0.465 | 0.496 |
| Aug 07, 2017 | 1.514 | 0.772 | 0.467 | 0.498 |
| Aug 08, 2017 | 1.507 | 0.768 | 0.464 | 0.495 |
| Aug 09, 2017 | 1.501 | 0.763 | 0.462 | 0.494 |
| Aug 10, 2017 | 1.409 | 0.726 | 0.448 | 0.473 |
| Aug 11, 2017 | 1.453 | 0.737 | 0.449 | 0.474 |
| Aug 14, 2017 | 1.508 | 0.76 | 0.458 | 0.489 |
| Aug 15, 2017 | 1.498 | 0.758 | 0.459 | 0.488 |
| Aug 16, 2017 | 1.523 | 0.761 | 0.46 | 0.491 |
| Aug 17, 2017 | 1.473 | 0.727 | 0.442 | 0.468 |
| Aug 18, 2017 | 1.483 | 0.725 | 0.437 | 0.465 |
| Aug 21, 2017 | 1.488 | 0.725 | 0.439 | 0.467 |
| Aug 22, 2017 | 1.532 | 0.748 | 0.452 | 0.481 |
| Aug 23, 2017 | 1.528 | 0.743 | 0.446 | 0.476 |
| Aug 24, 2017 | 1.536 | 0.741 | 0.444 | 0.473 |
| Aug 25, 2017 | 1.499 | 0.739 | 0.446 | 0.475 |
| Aug 28, 2017 | 1.511 | 0.744 | 0.446 | 0.476 |
| Aug 29, 2017 | 1.519 | 0.749 | 0.45 | 0.477 |
| Aug 30, 2017 | 1.561 | 0.768 | 0.452 | 0.484 |
| Aug 31, 2017 | 1.592 | 0.784 | 0.455 | 0.493 |
| Sep 01, 2017 | 1.586 | 0.786 | 0.458 | 0.496 |
| Sep 05, 2017 | 1.579 | 0.77 | 0.442 | 0.484 |
| Sep 06, 2017 | 1.566 | 0.775 | 0.446 | 0.489 |
| Sep 07, 2017 | 1.591 | 0.776 | 0.444 | 0.489 |
| Sep 08, 2017 | 1.589 | 0.765 | 0.445 | 0.487 |
| Sep 11, 2017 | 1.64 | 0.785 | 0.463 | 0.503 |
| Sep 12, 2017 | 1.631 | 0.791 | 0.467 | 0.508 |
| Sep 13, 2017 | 1.621 | 0.793 | 0.469 | 0.509 |
| Sep 14, 2017 | 1.634 | 0.784 | 0.472 | 0.507 |
| Sep 15, 2017 | 1.623 | 0.79 | 0.477 | 0.51 |
| Sep 18, 2017 | 1.646 | 0.792 | 0.481 | 0.512 |
| Sep 19, 2017 | 1.648 | 0.793 | 0.483 | 0.514 |
| Sep 20, 2017 | 1.621 | 0.792 | 0.486 | 0.515 |
| Sep 21, 2017 | 1.623 | 0.783 | 0.483 | 0.51 |
| Sep 22, 2017 | 1.636 | 0.784 | 0.482 | 0.511 |
| Sep 25, 2017 | 1.579 | 0.768 | 0.478 | 0.508 |
| Sep 26, 2017 | 1.567 | 0.771 | 0.478 | 0.508 |
| Sep 27, 2017 | 1.645 | 0.791 | 0.481 | 0.514 |
| Sep 28, 2017 | 1.643 | 0.791 | 0.484 | 0.516 |
| Sep 29, 2017 | 1.669 | 0.803 | 0.486 | 0.522 |
| Oct 02, 2017 | 1.697 | 0.809 | 0.496 | 0.527 |
| Oct 03, 2017 | 1.718 | 0.813 | 0.501 | 0.531 |
| Oct 04, 2017 | 1.709 | 0.814 | 0.503 | 0.533 |
| Oct 05, 2017 | 1.728 | 0.828 | 0.51 | 0.541 |
| Oct 06, 2017 | 1.755 | 0.829 | 0.51 | 0.54 |
| Oct 09, 2017 | 1.746 | 0.826 | 0.509 | 0.537 |
| Oct 10, 2017 | 1.735 | 0.828 | 0.514 | 0.54 |
| Oct 11, 2017 | 1.748 | 0.833 | 0.517 | 0.543 |
| Oct 12, 2017 | 1.761 | 0.83 | 0.515 | 0.541 |
| Oct 13, 2017 | 1.767 | 0.834 | 0.517 | 0.542 |
| Oct 16, 2017 | 1.75 | 0.839 | 0.522 | 0.545 |
| Oct 17, 2017 | 1.749 | 0.838 | 0.525 | 0.546 |
| Oct 18, 2017 | 1.769 | 0.839 | 0.536 | 0.547 |
| Oct 19, 2017 | 1.772 | 0.833 | 0.536 | 0.547 |
| Oct 20, 2017 | 1.835 | 0.84 | 0.547 | 0.555 |
| Oct 23, 2017 | 1.805 | 0.828 | 0.543 | 0.549 |
| Oct 24, 2017 | 1.823 | 0.831 | 0.554 | 0.552 |
| Oct 25, 2017 | 1.802 | 0.822 | 0.547 | 0.544 |
| Oct 26, 2017 | 1.81 | 0.82 | 0.552 | 0.546 |
| Oct 27, 2017 | 1.838 | 0.86 | 0.554 | 0.559 |
| Oct 30, 2017 | 1.836 | 0.859 | 0.548 | 0.554 |
| Oct 31, 2017 | 1.894 | 0.867 | 0.55 | 0.555 |
| Nov 01, 2017 | 1.862 | 0.864 | 0.554 | 0.558 |
| Nov 02, 2017 | 1.88 | 0.864 | 0.559 | 0.558 |
| Nov 03, 2017 | 1.903 | 0.878 | 0.561 | 0.563 |
| Nov 06, 2017 | 1.899 | 0.884 | 0.561 | 0.565 |
| Nov 07, 2017 | 1.861 | 0.878 | 0.562 | 0.565 |
| Nov 08, 2017 | 1.881 | 0.884 | 0.562 | 0.567 |
| Nov 09, 2017 | 1.845 | 0.874 | 0.556 | 0.561 |
| Nov 10, 2017 | 1.863 | 0.874 | 0.553 | 0.56 |
| Nov 13, 2017 | 1.86 | 0.876 | 0.554 | 0.561 |
| Nov 14, 2017 | 1.858 | 0.87 | 0.552 | 0.557 |
| Nov 15, 2017 | 1.837 | 0.861 | 0.543 | 0.549 |
| Nov 16, 2017 | 1.907 | 0.886 | 0.555 | 0.562 |
| Nov 17, 2017 | 1.91 | 0.883 | 0.549 | 0.557 |
| Nov 20, 2017 | 1.927 | 0.885 | 0.554 | 0.559 |
| Nov 21, 2017 | 1.963 | 0.905 | 0.564 | 0.57 |
| Nov 22, 2017 | 1.966 | 0.906 | 0.56 | 0.568 |
| Nov 24, 2017 | 1.998 | 0.912 | 0.562 | 0.572 |
| Nov 27, 2017 | 1.958 | 0.909 | 0.564 | 0.571 |
| Nov 28, 2017 | 1.976 | 0.919 | 0.581 | 0.587 |
| Nov 29, 2017 | 1.856 | 0.894 | 0.587 | 0.586 |
| Nov 30, 2017 | 1.874 | 0.908 | 0.609 | 0.599 |
| Dec 01, 2017 | 1.85 | 0.901 | 0.607 | 0.596 |
| Dec 04, 2017 | 1.738 | 0.881 | 0.611 | 0.594 |
| Dec 05, 2017 | 1.736 | 0.877 | 0.603 | 0.588 |
| Dec 06, 2017 | 1.75 | 0.881 | 0.601 | 0.588 |
| Dec 07, 2017 | 1.81 | 0.891 | 0.605 | 0.593 |
| Dec 08, 2017 | 1.804 | 0.899 | 0.613 | 0.601 |
| Dec 11, 2017 | 1.822 | 0.908 | 0.617 | 0.606 |
| Dec 12, 2017 | 1.791 | 0.905 | 0.625 | 0.609 |
| Dec 13, 2017 | 1.814 | 0.908 | 0.63 | 0.608 |
| Dec 14, 2017 | 1.822 | 0.903 | 0.625 | 0.602 |
| Dec 15, 2017 | 1.868 | 0.925 | 0.635 | 0.616 |
| Dec 18, 2017 | 1.893 | 0.941 | 0.644 | 0.625 |
| Dec 19, 2017 | 1.864 | 0.933 | 0.641 | 0.619 |
| Dec 20, 2017 | 1.845 | 0.932 | 0.64 | 0.618 |
| Dec 21, 2017 | 1.84 | 0.933 | 0.643 | 0.621 |
| Dec 22, 2017 | 1.823 | 0.932 | 0.641 | 0.621 |
| Dec 26, 2017 | 1.833 | 0.925 | 0.641 | 0.619 |
| Dec 27, 2017 | 1.838 | 0.926 | 0.643 | 0.62 |
| Dec 28, 2017 | 1.837 | 0.929 | 0.647 | 0.623 |
| Dec 29, 2017 | 1.813 | 0.916 | 0.639 | 0.615 |
| Jan 02, 2018 | 1.85 | 0.945 | 0.646 | 0.628 |
| Jan 03, 2018 | 1.886 | 0.961 | 0.653 | 0.638 |
| Jan 04, 2018 | 1.925 | 0.965 | 0.663 | 0.645 |
| Jan 05, 2018 | 1.939 | 0.981 | 0.677 | 0.657 |
| Jan 08, 2018 | 1.955 | 0.987 | 0.676 | 0.659 |
| Jan 09, 2018 | 1.952 | 0.988 | 0.683 | 0.662 |
| Jan 10, 2018 | 1.943 | 0.986 | 0.682 | 0.66 |
| Jan 11, 2018 | 1.999 | 1.002 | 0.696 | 0.671 |
| Jan 12, 2018 | 2.026 | 1.015 | 0.711 | 0.683 |
| Jan 16, 2018 | 1.982 | 1.005 | 0.71 | 0.677 |
| Jan 17, 2018 | 2.017 | 1.026 | 0.732 | 0.693 |
| Jan 18, 2018 | 2.032 | 1.025 | 0.725 | 0.69 |
| Jan 19, 2018 | 2.07 | 1.036 | 0.729 | 0.697 |
| Jan 22, 2018 | 2.095 | 1.056 | 0.738 | 0.711 |
| Jan 23, 2018 | 2.121 | 1.071 | 0.738 | 0.715 |
| Jan 24, 2018 | 2.098 | 1.058 | 0.741 | 0.714 |
| Jan 25, 2018 | 2.109 | 1.057 | 0.75 | 0.715 |
| Jan 26, 2018 | 2.176 | 1.083 | 0.765 | 0.735 |
| Jan 29, 2018 | 2.139 | 1.072 | 0.753 | 0.723 |
| Jan 30, 2018 | 2.123 | 1.055 | 0.729 | 0.705 |
| Jan 31, 2018 | 2.146 | 1.057 | 0.734 | 0.705 |
| Feb 01, 2018 | 2.126 | 1.05 | 0.736 | 0.704 |
| Feb 02, 2018 | 2.075 | 1.01 | 0.692 | 0.668 |
| Feb 05, 2018 | 1.984 | 0.934 | 0.614 | 0.6 |
| Feb 06, 2018 | 2.025 | 0.975 | 0.652 | 0.628 |
| Feb 07, 2018 | 2.045 | 0.957 | 0.651 | 0.62 |
| Feb 08, 2018 | 1.934 | 0.881 | 0.582 | 0.559 |
| Feb 09, 2018 | 1.979 | 0.908 | 0.604 | 0.582 |
| Feb 12, 2018 | 2.029 | 0.938 | 0.631 | 0.604 |
| Feb 13, 2018 | 2.092 | 0.947 | 0.634 | 0.608 |
| Feb 14, 2018 | 2.198 | 0.983 | 0.651 | 0.63 |
| Feb 15, 2018 | 2.279 | 1.014 | 0.671 | 0.649 |
| Feb 16, 2018 | 2.295 | 1.009 | 0.672 | 0.65 |
| Feb 20, 2018 | 2.328 | 1.008 | 0.655 | 0.64 |
| Feb 21, 2018 | 2.325 | 1.004 | 0.644 | 0.631 |
| Feb 22, 2018 | 2.33 | 1.001 | 0.655 | 0.633 |
| Feb 23, 2018 | 2.384 | 1.037 | 0.678 | 0.659 |
| Feb 26, 2018 | 2.422 | 1.06 | 0.705 | 0.679 |
| Feb 27, 2018 | 2.401 | 1.035 | 0.685 | 0.657 |
| Feb 28, 2018 | 2.404 | 1.019 | 0.66 | 0.639 |
| Mar 01, 2018 | 2.377 | 0.993 | 0.632 | 0.617 |
| Mar 02, 2018 | 2.476 | 1.015 | 0.627 | 0.625 |
| Mar 05, 2018 | 2.523 | 1.035 | 0.649 | 0.643 |
| Mar 06, 2018 | 2.546 | 1.046 | 0.65 | 0.648 |
| Mar 07, 2018 | 2.599 | 1.053 | 0.644 | 0.647 |
| Mar 08, 2018 | 2.633 | 1.062 | 0.651 | 0.654 |
| Mar 09, 2018 | 2.642 | 1.099 | 0.68 | 0.683 |
| Mar 12, 2018 | 2.655 | 1.106 | 0.67 | 0.681 |
| Mar 13, 2018 | 2.604 | 1.085 | 0.658 | 0.67 |
| Mar 14, 2018 | 2.648 | 1.081 | 0.642 | 0.66 |
| Mar 15, 2018 | 2.633 | 1.077 | 0.649 | 0.659 |
| Mar 16, 2018 | 2.641 | 1.077 | 0.654 | 0.662 |
| Mar 19, 2018 | 2.582 | 1.038 | 0.632 | 0.638 |
| Mar 20, 2018 | 2.652 | 1.044 | 0.64 | 0.641 |
| Mar 21, 2018 | 2.664 | 1.039 | 0.637 | 0.638 |
| Mar 22, 2018 | 2.591 | 0.989 | 0.589 | 0.597 |
| Mar 23, 2018 | 2.493 | 0.941 | 0.56 | 0.563 |
| Mar 26, 2018 | 2.611 | 1.004 | 0.605 | 0.606 |
| Mar 27, 2018 | 2.463 | 0.945 | 0.582 | 0.578 |
| Mar 28, 2018 | 2.383 | 0.929 | 0.581 | 0.573 |
| Mar 29, 2018 | 2.46 | 0.961 | 0.598 | 0.595 |
| Apr 02, 2018 | 2.384 | 0.907 | 0.568 | 0.559 |
| Apr 03, 2018 | 2.412 | 0.927 | 0.594 | 0.579 |
| Apr 04, 2018 | 2.465 | 0.955 | 0.609 | 0.597 |
| Apr 05, 2018 | 2.474 | 0.964 | 0.625 | 0.608 |
| Apr 06, 2018 | 2.412 | 0.919 | 0.587 | 0.573 |
| Apr 09, 2018 | 2.426 | 0.929 | 0.59 | 0.578 |
| Apr 10, 2018 | 2.495 | 0.969 | 0.618 | 0.605 |
| Apr 11, 2018 | 2.511 | 0.962 | 0.604 | 0.596 |
| Apr 12, 2018 | 2.558 | 0.982 | 0.623 | 0.609 |
| Apr 13, 2018 | 2.513 | 0.973 | 0.615 | 0.604 |
| Apr 16, 2018 | 2.549 | 0.986 | 0.629 | 0.617 |
| Apr 17, 2018 | 2.658 | 1.021 | 0.644 | 0.634 |
| Apr 18, 2018 | 2.689 | 1.025 | 0.641 | 0.636 |
| Apr 19, 2018 | 2.673 | 1.009 | 0.635 | 0.626 |
| Apr 20, 2018 | 2.623 | 0.984 | 0.622 | 0.613 |
| Apr 23, 2018 | 2.61 | 0.979 | 0.621 | 0.613 |
| Apr 24, 2018 | 2.531 | 0.945 | 0.593 | 0.591 |
| Apr 25, 2018 | 2.5 | 0.944 | 0.597 | 0.594 |
| Apr 26, 2018 | 2.581 | 0.976 | 0.613 | 0.611 |
| Apr 27, 2018 | 2.552 | 0.976 | 0.612 | 0.612 |
| Apr 30, 2018 | 2.57 | 0.961 | 0.602 | 0.599 |
| May 01, 2018 | 2.589 | 0.979 | 0.598 | 0.603 |
| May 02, 2018 | 2.624 | 0.971 | 0.586 | 0.592 |
| May 03, 2018 | 2.68 | 0.967 | 0.587 | 0.588 |
| May 04, 2018 | 2.745 | 1.001 | 0.609 | 0.609 |
| May 07, 2018 | 2.799 | 1.017 | 0.615 | 0.614 |
| May 08, 2018 | 2.857 | 1.017 | 0.615 | 0.614 |
| May 09, 2018 | 2.919 | 1.037 | 0.627 | 0.629 |
| May 10, 2018 | 2.967 | 1.055 | 0.64 | 0.645 |
| May 11, 2018 | 2.945 | 1.055 | 0.646 | 0.647 |
| May 14, 2018 | 2.865 | 1.057 | 0.651 | 0.649 |
| May 15, 2018 | 2.862 | 1.041 | 0.638 | 0.638 |
| May 16, 2018 | 2.899 | 1.053 | 0.642 | 0.644 |
| May 17, 2018 | 2.909 | 1.049 | 0.639 | 0.643 |
| May 18, 2018 | 2.961 | 1.041 | 0.639 | 0.638 |
| May 21, 2018 | 2.936 | 1.052 | 0.659 | 0.651 |
| May 22, 2018 | 2.865 | 1.048 | 0.647 | 0.645 |
| May 23, 2018 | 2.903 | 1.061 | 0.65 | 0.651 |
| May 24, 2018 | 2.922 | 1.061 | 0.645 | 0.647 |
| May 25, 2018 | 2.939 | 1.063 | 0.641 | 0.643 |
| May 29, 2018 | 2.963 | 1.053 | 0.615 | 0.624 |
| May 30, 2018 | 3.011 | 1.071 | 0.636 | 0.645 |
| May 31, 2018 | 3.017 | 1.066 | 0.619 | 0.634 |
| Jun 01, 2018 | 3.083 | 1.097 | 0.633 | 0.652 |
| Jun 04, 2018 | 3.134 | 1.111 | 0.645 | 0.659 |
| Jun 05, 2018 | 3.171 | 1.12 | 0.644 | 0.66 |
| Jun 06, 2018 | 3.202 | 1.134 | 0.667 | 0.674 |
| Jun 07, 2018 | 3.068 | 1.119 | 0.674 | 0.673 |
| Jun 08, 2018 | 3.113 | 1.122 | 0.679 | 0.678 |
| Jun 11, 2018 | 3.139 | 1.126 | 0.679 | 0.68 |
| Jun 12, 2018 | 3.239 | 1.138 | 0.679 | 0.683 |
| Jun 13, 2018 | 3.254 | 1.136 | 0.671 | 0.676 |
| Jun 14, 2018 | 3.31 | 1.154 | 0.669 | 0.68 |
| Jun 15, 2018 | 3.317 | 1.15 | 0.664 | 0.679 |
| Jun 18, 2018 | 3.375 | 1.15 | 0.657 | 0.675 |
| Jun 19, 2018 | 3.331 | 1.144 | 0.638 | 0.668 |
| Jun 20, 2018 | 3.365 | 1.16 | 0.635 | 0.671 |
| Jun 21, 2018 | 3.277 | 1.141 | 0.622 | 0.661 |
| Jun 22, 2018 | 3.168 | 1.135 | 0.63 | 0.664 |
| Jun 25, 2018 | 3.02 | 1.091 | 0.608 | 0.641 |
| Jun 26, 2018 | 3.056 | 1.099 | 0.61 | 0.645 |
| Jun 27, 2018 | 2.924 | 1.066 | 0.599 | 0.63 |
| Jun 28, 2018 | 3.02 | 1.083 | 0.606 | 0.64 |
| Jun 29, 2018 | 3.032 | 1.085 | 0.609 | 0.642 |
| Jul 02, 2018 | 3.098 | 1.101 | 0.612 | 0.647 |
| Jul 03, 2018 | 3.084 | 1.082 | 0.603 | 0.639 |
| Jul 05, 2018 | 3.135 | 1.106 | 0.615 | 0.653 |
| Jul 06, 2018 | 3.209 | 1.134 | 0.622 | 0.667 |
| Jul 09, 2018 | 3.224 | 1.153 | 0.643 | 0.681 |
| Jul 10, 2018 | 3.187 | 1.154 | 0.652 | 0.687 |
| Jul 11, 2018 | 3.199 | 1.142 | 0.638 | 0.675 |
| Jul 12, 2018 | 3.321 | 1.172 | 0.653 | 0.69 |
| Jul 13, 2018 | 3.305 | 1.172 | 0.659 | 0.692 |
| Jul 16, 2018 | 3.298 | 1.167 | 0.662 | 0.69 |
| Jul 17, 2018 | 3.367 | 1.18 | 0.666 | 0.697 |
| Jul 18, 2018 | 3.374 | 1.18 | 0.671 | 0.7 |
| Jul 19, 2018 | 3.362 | 1.172 | 0.662 | 0.694 |
| Jul 20, 2018 | 3.355 | 1.171 | 0.662 | 0.692 |
| Jul 23, 2018 | 3.394 | 1.177 | 0.661 | 0.695 |
| Jul 24, 2018 | 3.278 | 1.176 | 0.674 | 0.703 |
| Jul 25, 2018 | 3.399 | 1.202 | 0.685 | 0.719 |
| Jul 26, 2018 | 3.391 | 1.179 | 0.693 | 0.714 |
| Jul 27, 2018 | 3.203 | 1.148 | 0.688 | 0.702 |
| Jul 30, 2018 | 3.016 | 1.118 | 0.678 | 0.693 |
| Jul 31, 2018 | 3.006 | 1.129 | 0.685 | 0.701 |
| Aug 01, 2018 | 3.099 | 1.139 | 0.68 | 0.699 |
| Aug 02, 2018 | 3.23 | 1.166 | 0.679 | 0.707 |
| Aug 03, 2018 | 3.173 | 1.168 | 0.688 | 0.715 |
| Aug 06, 2018 | 3.257 | 1.182 | 0.691 | 0.721 |
| Aug 07, 2018 | 3.332 | 1.188 | 0.699 | 0.726 |
| Aug 08, 2018 | 3.317 | 1.19 | 0.696 | 0.726 |
| Aug 09, 2018 | 3.37 | 1.19 | 0.691 | 0.723 |
| Aug 10, 2018 | 3.376 | 1.176 | 0.678 | 0.711 |
| Aug 13, 2018 | 3.334 | 1.17 | 0.67 | 0.704 |
| Aug 14, 2018 | 3.403 | 1.185 | 0.678 | 0.715 |
| Aug 15, 2018 | 3.332 | 1.158 | 0.668 | 0.702 |
| Aug 16, 2018 | 3.368 | 1.167 | 0.695 | 0.716 |
| Aug 17, 2018 | 3.371 | 1.17 | 0.702 | 0.721 |
| Aug 20, 2018 | 3.388 | 1.171 | 0.708 | 0.725 |
| Aug 21, 2018 | 3.436 | 1.181 | 0.712 | 0.729 |
| Aug 22, 2018 | 3.495 | 1.19 | 0.706 | 0.728 |
| Aug 23, 2018 | 3.544 | 1.187 | 0.701 | 0.725 |
| Aug 24, 2018 | 3.671 | 1.206 | 0.71 | 0.736 |
| Aug 27, 2018 | 3.701 | 1.225 | 0.727 | 0.749 |
| Aug 28, 2018 | 3.716 | 1.229 | 0.728 | 0.75 |
| Aug 29, 2018 | 3.763 | 1.251 | 0.732 | 0.76 |
| Aug 30, 2018 | 3.733 | 1.245 | 0.723 | 0.752 |
| Aug 31, 2018 | 3.732 | 1.251 | 0.722 | 0.752 |
| Sep 04, 2018 | 3.793 | 1.246 | 0.721 | 0.749 |
| Sep 05, 2018 | 3.643 | 1.219 | 0.722 | 0.745 |
| Sep 06, 2018 | 3.646 | 1.199 | 0.724 | 0.738 |
| Sep 07, 2018 | 3.739 | 1.193 | 0.718 | 0.734 |
| Sep 10, 2018 | 3.772 | 1.199 | 0.714 | 0.738 |
| Sep 11, 2018 | 3.81 | 1.213 | 0.722 | 0.744 |
| Sep 12, 2018 | 3.81 | 1.208 | 0.724 | 0.745 |
| Sep 13, 2018 | 3.824 | 1.224 | 0.734 | 0.754 |
| Sep 14, 2018 | 3.835 | 1.223 | 0.734 | 0.754 |
| Sep 17, 2018 | 3.673 | 1.192 | 0.728 | 0.745 |
| Sep 18, 2018 | 3.73 | 1.208 | 0.74 | 0.754 |
| Sep 19, 2018 | 3.634 | 1.207 | 0.751 | 0.756 |
| Sep 20, 2018 | 3.682 | 1.228 | 0.768 | 0.77 |
| Sep 21, 2018 | 3.619 | 1.217 | 0.773 | 0.769 |
| Sep 24, 2018 | 3.641 | 1.219 | 0.761 | 0.763 |
| Sep 25, 2018 | 3.732 | 1.223 | 0.757 | 0.761 |
| Sep 26, 2018 | 3.671 | 1.218 | 0.75 | 0.755 |
| Sep 27, 2018 | 3.685 | 1.232 | 0.753 | 0.76 |
| Sep 28, 2018 | 3.694 | 1.233 | 0.754 | 0.76 |
| Oct 01, 2018 | 3.591 | 1.231 | 0.767 | 0.766 |
| Oct 02, 2018 | 3.463 | 1.22 | 0.775 | 0.766 |
| Oct 03, 2018 | 3.507 | 1.227 | 0.779 | 0.767 |
| Oct 04, 2018 | 3.361 | 1.187 | 0.766 | 0.752 |
| Oct 05, 2018 | 3.328 | 1.162 | 0.754 | 0.743 |
| Oct 08, 2018 | 3.153 | 1.147 | 0.756 | 0.742 |
| Oct 09, 2018 | 3.109 | 1.148 | 0.753 | 0.74 |
| Oct 10, 2018 | 2.893 | 1.06 | 0.697 | 0.682 |
| Oct 11, 2018 | 2.848 | 1.034 | 0.661 | 0.648 |
| Oct 12, 2018 | 3.02 | 1.081 | 0.68 | 0.671 |
| Oct 15, 2018 | 2.994 | 1.063 | 0.674 | 0.661 |
| Oct 16, 2018 | 3.208 | 1.122 | 0.711 | 0.697 |
| Oct 17, 2018 | 3.187 | 1.121 | 0.705 | 0.697 |
| Oct 18, 2018 | 3.078 | 1.078 | 0.683 | 0.672 |
| Oct 19, 2018 | 2.937 | 1.068 | 0.687 | 0.672 |
| Oct 22, 2018 | 3.019 | 1.073 | 0.679 | 0.664 |
| Oct 23, 2018 | 2.995 | 1.064 | 0.67 | 0.655 |
| Oct 24, 2018 | 2.786 | 0.973 | 0.63 | 0.604 |
| Oct 25, 2018 | 2.924 | 1.031 | 0.657 | 0.634 |
| Oct 26, 2018 | 2.8 | 0.989 | 0.637 | 0.606 |
| Oct 29, 2018 | 2.763 | 0.957 | 0.621 | 0.595 |
| Oct 30, 2018 | 2.849 | 0.988 | 0.649 | 0.62 |
| Oct 31, 2018 | 2.981 | 1.028 | 0.665 | 0.638 |
| Nov 01, 2018 | 3.066 | 1.063 | 0.683 | 0.655 |
| Nov 02, 2018 | 2.994 | 1.042 | 0.676 | 0.645 |
| Nov 05, 2018 | 2.932 | 1.034 | 0.688 | 0.654 |
| Nov 06, 2018 | 2.925 | 1.047 | 0.7 | 0.664 |
| Nov 07, 2018 | 3.182 | 1.101 | 0.736 | 0.699 |
| Nov 08, 2018 | 3.133 | 1.09 | 0.737 | 0.695 |
| Nov 09, 2018 | 3.038 | 1.056 | 0.723 | 0.68 |
| Nov 12, 2018 | 2.901 | 0.999 | 0.683 | 0.646 |
| Nov 13, 2018 | 2.913 | 0.999 | 0.677 | 0.644 |
| Nov 14, 2018 | 2.878 | 0.981 | 0.663 | 0.632 |
| Nov 15, 2018 | 3.018 | 1.015 | 0.677 | 0.649 |
| Nov 16, 2018 | 2.986 | 1.012 | 0.685 | 0.653 |
| Nov 19, 2018 | 2.64 | 0.951 | 0.659 | 0.625 |
| Nov 20, 2018 | 2.633 | 0.918 | 0.622 | 0.596 |
| Nov 21, 2018 | 2.731 | 0.935 | 0.622 | 0.6 |
| Nov 23, 2018 | 2.763 | 0.926 | 0.61 | 0.59 |
| Nov 26, 2018 | 2.906 | 0.966 | 0.634 | 0.615 |
| Nov 27, 2018 | 2.861 | 0.966 | 0.641 | 0.62 |
| Nov 28, 2018 | 3.07 | 1.024 | 0.682 | 0.657 |
| Nov 29, 2018 | 3.104 | 1.019 | 0.68 | 0.653 |
| Nov 30, 2018 | 3.162 | 1.035 | 0.693 | 0.667 |
| Dec 03, 2018 | 3.223 | 1.065 | 0.712 | 0.685 |
| Dec 04, 2018 | 3.033 | 0.987 | 0.659 | 0.631 |
| Dec 06, 2018 | 3.129 | 0.995 | 0.654 | 0.628 |
| Dec 07, 2018 | 2.959 | 0.934 | 0.617 | 0.59 |
| Dec 10, 2018 | 3.034 | 0.949 | 0.619 | 0.593 |
| Dec 11, 2018 | 3.042 | 0.952 | 0.616 | 0.592 |
| Dec 12, 2018 | 3.126 | 0.97 | 0.626 | 0.601 |
| Dec 13, 2018 | 3.104 | 0.962 | 0.631 | 0.601 |
| Dec 14, 2018 | 3.01 | 0.918 | 0.598 | 0.57 |
| Dec 17, 2018 | 2.81 | 0.875 | 0.564 | 0.538 |
| Dec 18, 2018 | 2.867 | 0.883 | 0.57 | 0.538 |
| Dec 19, 2018 | 2.862 | 0.842 | 0.547 | 0.514 |
| Dec 20, 2018 | 2.747 | 0.812 | 0.516 | 0.49 |
| Dec 21, 2018 | 2.574 | 0.758 | 0.488 | 0.459 |
| Dec 24, 2018 | 2.581 | 0.719 | 0.445 | 0.42 |
| Dec 26, 2018 | 2.841 | 0.819 | 0.517 | 0.49 |
| Dec 27, 2018 | 2.908 | 0.826 | 0.534 | 0.503 |
| Dec 28, 2018 | 2.9 | 0.828 | 0.529 | 0.501 |
| Dec 31, 2018 | 2.949 | 0.842 | 0.547 | 0.514 |
| Jan 02, 2019 | 2.929 | 0.85 | 0.548 | 0.516 |
| Jan 03, 2019 | 2.78 | 0.794 | 0.504 | 0.478 |
| Jan 04, 2019 | 2.967 | 0.87 | 0.554 | 0.529 |
| Jan 07, 2019 | 3.112 | 0.894 | 0.56 | 0.54 |
| Jan 08, 2019 | 3.178 | 0.914 | 0.577 | 0.555 |
| Jan 09, 2019 | 3.206 | 0.931 | 0.583 | 0.561 |
| Jan 10, 2019 | 3.222 | 0.939 | 0.591 | 0.568 |
| Jan 11, 2019 | 3.216 | 0.935 | 0.591 | 0.568 |
| Jan 14, 2019 | 3.155 | 0.917 | 0.585 | 0.56 |
| Jan 15, 2019 | 3.258 | 0.95 | 0.596 | 0.576 |
| Jan 16, 2019 | 3.257 | 0.953 | 0.605 | 0.58 |
| Jan 17, 2019 | 3.32 | 0.966 | 0.616 | 0.592 |
| Jan 18, 2019 | 3.409 | 0.987 | 0.638 | 0.613 |
| Jan 22, 2019 | 3.33 | 0.949 | 0.618 | 0.59 |
| Jan 23, 2019 | 3.338 | 0.95 | 0.63 | 0.594 |
| Jan 24, 2019 | 3.371 | 0.963 | 0.628 | 0.596 |
| Jan 25, 2019 | 3.477 | 0.989 | 0.64 | 0.609 |
| Jan 28, 2019 | 3.443 | 0.967 | 0.626 | 0.597 |
| Jan 29, 2019 | 3.367 | 0.951 | 0.63 | 0.594 |
| Jan 30, 2019 | 3.475 | 0.994 | 0.659 | 0.619 |
| Jan 31, 2019 | 3.623 | 1.021 | 0.658 | 0.633 |
| Feb 01, 2019 | 3.696 | 1.016 | 0.662 | 0.635 |
| Feb 04, 2019 | 3.797 | 1.039 | 0.674 | 0.646 |
| Feb 05, 2019 | 3.835 | 1.055 | 0.685 | 0.653 |
| Feb 06, 2019 | 3.845 | 1.047 | 0.684 | 0.65 |
| Feb 07, 2019 | 3.796 | 1.023 | 0.669 | 0.634 |
| Feb 08, 2019 | 3.877 | 1.026 | 0.665 | 0.635 |
| Feb 11, 2019 | 3.874 | 1.028 | 0.661 | 0.637 |
| Feb 12, 2019 | 3.99 | 1.058 | 0.686 | 0.658 |
| Feb 13, 2019 | 3.961 | 1.06 | 0.694 | 0.663 |
| Feb 14, 2019 | 3.998 | 1.061 | 0.687 | 0.658 |
| Feb 15, 2019 | 4.011 | 1.074 | 0.716 | 0.676 |
| Feb 19, 2019 | 4.031 | 1.078 | 0.717 | 0.679 |
| Feb 20, 2019 | 4.008 | 1.079 | 0.721 | 0.682 |
| Feb 21, 2019 | 3.985 | 1.071 | 0.714 | 0.676 |
| Feb 22, 2019 | 4.053 | 1.089 | 0.726 | 0.687 |
| Feb 25, 2019 | 4.097 | 1.097 | 0.73 | 0.689 |
| Feb 26, 2019 | 4.085 | 1.095 | 0.728 | 0.687 |
| Feb 27, 2019 | 4.15 | 1.097 | 0.723 | 0.686 |
| Feb 28, 2019 | 4.106 | 1.091 | 0.718 | 0.682 |
| Mar 01, 2019 | 4.167 | 1.108 | 0.726 | 0.693 |
| Mar 04, 2019 | 4.024 | 1.103 | 0.712 | 0.687 |
| Mar 05, 2019 | 3.998 | 1.103 | 0.711 | 0.685 |
| Mar 06, 2019 | 3.943 | 1.083 | 0.702 | 0.674 |
| Mar 07, 2019 | 3.971 | 1.06 | 0.689 | 0.66 |
| Mar 08, 2019 | 3.977 | 1.056 | 0.688 | 0.657 |
| Mar 11, 2019 | 4.104 | 1.098 | 0.701 | 0.681 |
| Mar 12, 2019 | 4.12 | 1.107 | 0.694 | 0.686 |
| Mar 13, 2019 | 4.134 | 1.122 | 0.704 | 0.698 |
| Mar 14, 2019 | 4.202 | 1.118 | 0.705 | 0.696 |
| Mar 15, 2019 | 4.197 | 1.134 | 0.714 | 0.705 |
| Mar 18, 2019 | 4.211 | 1.141 | 0.718 | 0.711 |
| Mar 19, 2019 | 4.249 | 1.144 | 0.717 | 0.711 |
| Mar 20, 2019 | 4.251 | 1.145 | 0.707 | 0.706 |
| Mar 21, 2019 | 4.373 | 1.176 | 0.721 | 0.724 |
| Mar 22, 2019 | 4.144 | 1.121 | 0.691 | 0.691 |
| Mar 25, 2019 | 4.162 | 1.12 | 0.692 | 0.69 |
| Mar 26, 2019 | 4.218 | 1.135 | 0.701 | 0.702 |
| Mar 27, 2019 | 4.118 | 1.122 | 0.699 | 0.694 |
| Mar 28, 2019 | 4.157 | 1.129 | 0.705 | 0.7 |
| Mar 29, 2019 | 4.207 | 1.145 | 0.719 | 0.712 |
| Apr 01, 2019 | 4.217 | 1.173 | 0.741 | 0.732 |
| Apr 02, 2019 | 4.256 | 1.179 | 0.736 | 0.732 |
| Apr 03, 2019 | 4.272 | 1.192 | 0.738 | 0.735 |
| Apr 04, 2019 | 4.12 | 1.19 | 0.749 | 0.739 |
| Apr 05, 2019 | 4.136 | 1.203 | 0.752 | 0.747 |
| Apr 08, 2019 | 4.13 | 1.208 | 0.747 | 0.749 |
| Apr 09, 2019 | 4.143 | 1.195 | 0.734 | 0.738 |
| Apr 10, 2019 | 4.203 | 1.211 | 0.734 | 0.744 |
| Apr 11, 2019 | 4.233 | 1.206 | 0.733 | 0.744 |
| Apr 12, 2019 | 4.243 | 1.216 | 0.751 | 0.756 |
| Apr 15, 2019 | 4.251 | 1.214 | 0.749 | 0.755 |
| Apr 16, 2019 | 4.238 | 1.221 | 0.754 | 0.756 |
| Apr 17, 2019 | 4.144 | 1.219 | 0.754 | 0.752 |
| Apr 18, 2019 | 4.105 | 1.22 | 0.761 | 0.754 |
| Apr 22, 2019 | 4.214 | 1.225 | 0.758 | 0.756 |
| Apr 23, 2019 | 4.317 | 1.254 | 0.767 | 0.772 |
| Apr 24, 2019 | 4.315 | 1.249 | 0.764 | 0.768 |
| Apr 25, 2019 | 4.373 | 1.253 | 0.755 | 0.767 |
| Apr 26, 2019 | 4.442 | 1.261 | 0.76 | 0.775 |
| Apr 29, 2019 | 4.498 | 1.265 | 0.761 | 0.777 |
| Apr 30, 2019 | 4.518 | 1.247 | 0.763 | 0.779 |
| May 01, 2019 | 4.427 | 1.234 | 0.752 | 0.766 |
| May 02, 2019 | 4.428 | 1.231 | 0.744 | 0.762 |
| May 03, 2019 | 4.53 | 1.266 | 0.757 | 0.779 |
| May 06, 2019 | 4.529 | 1.255 | 0.753 | 0.771 |
| May 07, 2019 | 4.414 | 1.21 | 0.722 | 0.742 |
| May 08, 2019 | 4.43 | 1.205 | 0.722 | 0.739 |
| May 09, 2019 | 4.477 | 1.196 | 0.713 | 0.734 |
| May 10, 2019 | 4.518 | 1.197 | 0.72 | 0.74 |
| May 13, 2019 | 4.247 | 1.123 | 0.679 | 0.698 |
| May 14, 2019 | 4.389 | 1.147 | 0.693 | 0.712 |
| May 15, 2019 | 4.452 | 1.171 | 0.701 | 0.722 |
| May 16, 2019 | 4.596 | 1.192 | 0.715 | 0.737 |
| May 17, 2019 | 4.538 | 1.17 | 0.708 | 0.727 |
| May 20, 2019 | 4.44 | 1.138 | 0.703 | 0.715 |
| May 21, 2019 | 4.516 | 1.161 | 0.716 | 0.73 |
| May 22, 2019 | 4.541 | 1.151 | 0.709 | 0.725 |
| May 23, 2019 | 4.407 | 1.117 | 0.69 | 0.704 |
| May 24, 2019 | 4.452 | 1.12 | 0.696 | 0.707 |
| May 28, 2019 | 4.512 | 1.112 | 0.681 | 0.692 |
| May 29, 2019 | 4.392 | 1.095 | 0.666 | 0.681 |
| May 30, 2019 | 4.444 | 1.101 | 0.669 | 0.684 |
| May 31, 2019 | 4.358 | 1.069 | 0.645 | 0.662 |
| Jun 03, 2019 | 4.09 | 1.035 | 0.646 | 0.657 |
| Jun 04, 2019 | 4.258 | 1.089 | 0.68 | 0.693 |
| Jun 05, 2019 | 4.357 | 1.103 | 0.693 | 0.707 |
| Jun 06, 2019 | 4.425 | 1.114 | 0.705 | 0.717 |
| Jun 07, 2019 | 4.478 | 1.149 | 0.723 | 0.735 |
| Jun 10, 2019 | 4.528 | 1.171 | 0.728 | 0.743 |
| Jun 11, 2019 | 4.42 | 1.171 | 0.727 | 0.743 |
| Jun 12, 2019 | 4.459 | 1.163 | 0.724 | 0.739 |
| Jun 13, 2019 | 4.482 | 1.175 | 0.731 | 0.746 |
| Jun 14, 2019 | 4.45 | 1.164 | 0.73 | 0.744 |
| Jun 17, 2019 | 4.541 | 1.177 | 0.731 | 0.745 |
| Jun 18, 2019 | 4.584 | 1.208 | 0.755 | 0.762 |
| Jun 19, 2019 | 4.693 | 1.217 | 0.757 | 0.767 |
| Jun 20, 2019 | 4.757 | 1.235 | 0.774 | 0.784 |
| Jun 21, 2019 | 4.679 | 1.229 | 0.772 | 0.782 |
| Jun 24, 2019 | 4.554 | 1.222 | 0.772 | 0.779 |
| Jun 25, 2019 | 4.42 | 1.189 | 0.76 | 0.762 |
| Jun 26, 2019 | 4.405 | 1.196 | 0.76 | 0.76 |
| Jun 27, 2019 | 4.524 | 1.212 | 0.759 | 0.766 |
| Jun 28, 2019 | 4.563 | 1.222 | 0.764 | 0.777 |
| Jul 01, 2019 | 4.63 | 1.246 | 0.772 | 0.79 |
| Jul 02, 2019 | 4.678 | 1.251 | 0.776 | 0.795 |
| Jul 03, 2019 | 4.737 | 1.268 | 0.788 | 0.809 |
| Jul 05, 2019 | 4.751 | 1.265 | 0.785 | 0.806 |
| Jul 08, 2019 | 4.753 | 1.248 | 0.777 | 0.797 |
| Jul 09, 2019 | 4.847 | 1.26 | 0.776 | 0.799 |
| Jul 10, 2019 | 4.888 | 1.277 | 0.781 | 0.808 |
| Jul 11, 2019 | 4.913 | 1.275 | 0.796 | 0.812 |
| Jul 12, 2019 | 4.919 | 1.288 | 0.812 | 0.82 |
| Jul 15, 2019 | 4.92 | 1.292 | 0.814 | 0.82 |
| Jul 16, 2019 | 4.838 | 1.282 | 0.813 | 0.814 |
| Jul 17, 2019 | 4.888 | 1.272 | 0.805 | 0.802 |
| Jul 18, 2019 | 4.896 | 1.278 | 0.805 | 0.809 |
| Jul 19, 2019 | 4.831 | 1.261 | 0.801 | 0.798 |
| Jul 22, 2019 | 4.856 | 1.277 | 0.802 | 0.803 |
| Jul 23, 2019 | 4.806 | 1.29 | 0.813 | 0.815 |
| Jul 24, 2019 | 4.902 | 1.31 | 0.808 | 0.824 |
| Jul 25, 2019 | 4.877 | 1.287 | 0.8 | 0.814 |
| Jul 26, 2019 | 4.963 | 1.312 | 0.803 | 0.827 |
| Jul 29, 2019 | 4.804 | 1.302 | 0.805 | 0.824 |
| Jul 30, 2019 | 4.808 | 1.296 | 0.803 | 0.82 |
| Jul 31, 2019 | 4.686 | 1.269 | 0.781 | 0.8 |
| Aug 01, 2019 | 4.651 | 1.251 | 0.763 | 0.784 |
| Aug 02, 2019 | 4.585 | 1.222 | 0.756 | 0.771 |
| Aug 05, 2019 | 4.326 | 1.144 | 0.705 | 0.718 |
| Aug 06, 2019 | 4.352 | 1.174 | 0.726 | 0.74 |
| Aug 07, 2019 | 4.381 | 1.182 | 0.724 | 0.742 |
| Aug 08, 2019 | 4.571 | 1.231 | 0.749 | 0.774 |
| Aug 09, 2019 | 4.552 | 1.209 | 0.743 | 0.763 |
| Aug 12, 2019 | 4.455 | 1.183 | 0.717 | 0.742 |
| Aug 13, 2019 | 4.533 | 1.225 | 0.743 | 0.767 |
| Aug 14, 2019 | 4.344 | 1.158 | 0.689 | 0.716 |
| Aug 15, 2019 | 4.351 | 1.156 | 0.696 | 0.72 |
| Aug 16, 2019 | 4.441 | 1.192 | 0.716 | 0.745 |
| Aug 19, 2019 | 4.435 | 1.221 | 0.733 | 0.766 |
| Aug 20, 2019 | 4.443 | 1.206 | 0.721 | 0.752 |
| Aug 21, 2019 | 4.534 | 1.226 | 0.737 | 0.766 |
| Aug 22, 2019 | 4.54 | 1.218 | 0.741 | 0.765 |
| Aug 23, 2019 | 4.469 | 1.152 | 0.699 | 0.719 |
| Aug 26, 2019 | 4.517 | 1.18 | 0.717 | 0.738 |
| Aug 27, 2019 | 4.485 | 1.172 | 0.709 | 0.733 |
| Aug 28, 2019 | 4.407 | 1.181 | 0.726 | 0.744 |
| Aug 29, 2019 | 4.523 | 1.213 | 0.748 | 0.766 |
| Aug 30, 2019 | 4.473 | 1.21 | 0.751 | 0.767 |
| Sep 03, 2019 | 4.402 | 1.186 | 0.732 | 0.755 |
| Sep 04, 2019 | 4.466 | 1.214 | 0.748 | 0.774 |
| Sep 05, 2019 | 4.512 | 1.253 | 0.772 | 0.797 |
| Sep 06, 2019 | 4.413 | 1.249 | 0.777 | 0.799 |
| Sep 09, 2019 | 4.244 | 1.245 | 0.779 | 0.799 |
| Sep 10, 2019 | 4.222 | 1.244 | 0.784 | 0.799 |
| Sep 11, 2019 | 4.267 | 1.268 | 0.799 | 0.812 |
| Sep 12, 2019 | 4.295 | 1.274 | 0.802 | 0.818 |
| Sep 13, 2019 | 4.209 | 1.27 | 0.805 | 0.816 |
| Sep 16, 2019 | 4.263 | 1.263 | 0.795 | 0.811 |
| Sep 17, 2019 | 4.336 | 1.272 | 0.798 | 0.815 |
| Sep 18, 2019 | 4.314 | 1.27 | 0.8 | 0.816 |
| Sep 19, 2019 | 4.332 | 1.271 | 0.797 | 0.816 |
| Sep 20, 2019 | 4.34 | 1.253 | 0.786 | 0.807 |
| Sep 23, 2019 | 4.297 | 1.252 | 0.787 | 0.807 |
| Sep 24, 2019 | 4.148 | 1.219 | 0.778 | 0.792 |
| Sep 25, 2019 | 4.178 | 1.242 | 0.788 | 0.803 |
| Sep 26, 2019 | 4.185 | 1.229 | 0.783 | 0.798 |
| Sep 27, 2019 | 4.033 | 1.204 | 0.778 | 0.789 |
| Sep 30, 2019 | 4.092 | 1.22 | 0.785 | 0.798 |
| Oct 01, 2019 | 4.06 | 1.195 | 0.762 | 0.776 |
| Oct 02, 2019 | 3.993 | 1.161 | 0.729 | 0.744 |
| Oct 03, 2019 | 4.14 | 1.185 | 0.737 | 0.758 |
| Oct 04, 2019 | 4.226 | 1.216 | 0.762 | 0.783 |
| Oct 07, 2019 | 4.269 | 1.208 | 0.756 | 0.775 |
| Oct 08, 2019 | 4.105 | 1.172 | 0.735 | 0.747 |
| Oct 09, 2019 | 4.192 | 1.194 | 0.747 | 0.763 |
| Oct 10, 2019 | 4.162 | 1.207 | 0.757 | 0.774 |
| Oct 11, 2019 | 4.257 | 1.236 | 0.778 | 0.794 |
| Oct 14, 2019 | 4.277 | 1.234 | 0.776 | 0.791 |
| Oct 15, 2019 | 4.302 | 1.262 | 0.792 | 0.809 |
| Oct 16, 2019 | 4.151 | 1.255 | 0.79 | 0.806 |
| Oct 17, 2019 | 4.127 | 1.264 | 0.792 | 0.811 |
| Oct 18, 2019 | 3.962 | 1.245 | 0.775 | 0.803 |
| Oct 21, 2019 | 4.002 | 1.266 | 0.779 | 0.816 |
| Oct 22, 2019 | 3.888 | 1.249 | 0.776 | 0.809 |
| Oct 23, 2019 | 3.896 | 1.254 | 0.779 | 0.815 |
| Oct 24, 2019 | 4.086 | 1.272 | 0.777 | 0.818 |
| Oct 25, 2019 | 4.124 | 1.288 | 0.787 | 0.825 |
| Oct 28, 2019 | 4.16 | 1.311 | 0.796 | 0.836 |
| Oct 29, 2019 | 4.14 | 1.297 | 0.795 | 0.834 |
| Oct 30, 2019 | 4.257 | 1.305 | 0.803 | 0.84 |
| Oct 31, 2019 | 4.177 | 1.302 | 0.793 | 0.834 |
| Nov 01, 2019 | 4.241 | 1.328 | 0.813 | 0.852 |
| Nov 04, 2019 | 4.221 | 1.341 | 0.821 | 0.859 |
| Nov 05, 2019 | 4.211 | 1.341 | 0.823 | 0.857 |
| Nov 06, 2019 | 4.201 | 1.334 | 0.823 | 0.858 |
| Nov 07, 2019 | 4.187 | 1.341 | 0.835 | 0.863 |
| Nov 08, 2019 | 4.261 | 1.352 | 0.835 | 0.868 |
| Nov 11, 2019 | 4.315 | 1.349 | 0.836 | 0.864 |
| Nov 12, 2019 | 4.339 | 1.355 | 0.836 | 0.867 |
| Nov 13, 2019 | 4.379 | 1.354 | 0.842 | 0.869 |
| Nov 14, 2019 | 4.384 | 1.353 | 0.842 | 0.87 |
| Nov 15, 2019 | 4.479 | 1.371 | 0.857 | 0.885 |
| Nov 18, 2019 | 4.491 | 1.373 | 0.859 | 0.885 |
| Nov 19, 2019 | 4.548 | 1.379 | 0.852 | 0.884 |
| Nov 20, 2019 | 4.597 | 1.367 | 0.845 | 0.877 |
| Nov 21, 2019 | 4.583 | 1.361 | 0.841 | 0.874 |
| Nov 22, 2019 | 4.603 | 1.365 | 0.848 | 0.878 |
| Nov 25, 2019 | 4.679 | 1.396 | 0.861 | 0.892 |
| Nov 26, 2019 | 4.715 | 1.4 | 0.865 | 0.897 |
| Nov 27, 2019 | 4.748 | 1.416 | 0.867 | 0.905 |
| Nov 29, 2019 | 4.734 | 1.405 | 0.86 | 0.897 |
| Dec 02, 2019 | 4.574 | 1.378 | 0.842 | 0.881 |
| Dec 03, 2019 | 4.617 | 1.365 | 0.824 | 0.868 |
| Dec 04, 2019 | 4.581 | 1.378 | 0.833 | 0.88 |
| Dec 05, 2019 | 4.541 | 1.379 | 0.835 | 0.883 |
| Dec 06, 2019 | 4.545 | 1.403 | 0.858 | 0.9 |
| Dec 09, 2019 | 4.535 | 1.393 | 0.851 | 0.894 |
| Dec 10, 2019 | 4.478 | 1.392 | 0.849 | 0.892 |
| Dec 11, 2019 | 4.432 | 1.402 | 0.851 | 0.897 |
| Dec 12, 2019 | 4.385 | 1.42 | 0.865 | 0.914 |
| Dec 13, 2019 | 4.455 | 1.424 | 0.866 | 0.914 |
| Dec 16, 2019 | 4.501 | 1.447 | 0.872 | 0.927 |
| Dec 17, 2019 | 4.476 | 1.449 | 0.874 | 0.928 |
| Dec 18, 2019 | 4.513 | 1.45 | 0.872 | 0.927 |
| Dec 19, 2019 | 4.553 | 1.467 | 0.882 | 0.936 |
| Dec 20, 2019 | 4.577 | 1.477 | 0.887 | 0.945 |
| Dec 23, 2019 | 4.575 | 1.483 | 0.893 | 0.947 |
| Dec 24, 2019 | 4.576 | 1.485 | 0.891 | 0.947 |
| Dec 26, 2019 | 4.605 | 1.504 | 0.898 | 0.957 |
| Dec 27, 2019 | 4.574 | 1.5 | 0.899 | 0.957 |
| Dec 30, 2019 | 4.502 | 1.483 | 0.887 | 0.945 |
| Dec 31, 2019 | 4.534 | 1.49 | 0.892 | 0.951 |
| Jan 02, 2020 | 4.654 | 1.524 | 0.914 | 0.968 |
| Jan 03, 2020 | 4.647 | 1.504 | 0.899 | 0.954 |
| Jan 06, 2020 | 4.754 | 1.518 | 0.903 | 0.961 |
| Jan 07, 2020 | 4.76 | 1.517 | 0.895 | 0.955 |
| Jan 08, 2020 | 4.832 | 1.534 | 0.906 | 0.965 |
| Jan 09, 2020 | 4.897 | 1.555 | 0.92 | 0.978 |
| Jan 10, 2020 | 4.879 | 1.548 | 0.911 | 0.972 |
| Jan 13, 2020 | 4.964 | 1.574 | 0.917 | 0.986 |
| Jan 14, 2020 | 4.946 | 1.568 | 0.919 | 0.983 |
| Jan 15, 2020 | 4.993 | 1.57 | 0.925 | 0.986 |
| Jan 16, 2020 | 5.054 | 1.597 | 0.943 | 1.003 |
| Jan 17, 2020 | 5.036 | 1.606 | 0.946 | 1.011 |
| Jan 21, 2020 | 5.038 | 1.601 | 0.936 | 1.006 |
| Jan 22, 2020 | 5.033 | 1.605 | 0.935 | 1.006 |
| Jan 23, 2020 | 5.057 | 1.61 | 0.934 | 1.008 |
| Jan 24, 2020 | 5.035 | 1.585 | 0.922 | 0.99 |
| Jan 27, 2020 | 4.94 | 1.537 | 0.892 | 0.959 |
| Jan 28, 2020 | 5.05 | 1.573 | 0.905 | 0.979 |
| Jan 29, 2020 | 5.069 | 1.574 | 0.905 | 0.977 |
| Jan 30, 2020 | 5.146 | 1.581 | 0.914 | 0.983 |
| Jan 31, 2020 | 5.053 | 1.54 | 0.874 | 0.948 |
| Feb 03, 2020 | 5.154 | 1.574 | 0.883 | 0.962 |
| Feb 04, 2020 | 5.32 | 1.628 | 0.91 | 0.992 |
| Feb 05, 2020 | 5.164 | 1.639 | 0.942 | 1.014 |
| Feb 06, 2020 | 5.189 | 1.657 | 0.948 | 1.021 |
| Feb 07, 2020 | 5.215 | 1.643 | 0.93 | 1.01 |
| Feb 10, 2020 | 5.286 | 1.672 | 0.941 | 1.024 |
| Feb 11, 2020 | 5.276 | 1.675 | 0.941 | 1.028 |
| Feb 12, 2020 | 5.318 | 1.7 | 0.959 | 1.041 |
| Feb 13, 2020 | 5.353 | 1.696 | 0.951 | 1.038 |
| Feb 14, 2020 | 5.417 | 1.701 | 0.949 | 1.041 |
| Feb 18, 2020 | 5.459 | 1.701 | 0.938 | 1.035 |
| Feb 19, 2020 | 5.535 | 1.725 | 0.946 | 1.045 |
| Feb 20, 2020 | 5.468 | 1.707 | 0.937 | 1.037 |
| Feb 21, 2020 | 5.33 | 1.658 | 0.922 | 1.016 |
| Feb 24, 2020 | 5.162 | 1.559 | 0.854 | 0.948 |
| Feb 25, 2020 | 5 | 1.489 | 0.796 | 0.889 |
| Feb 26, 2020 | 4.994 | 1.493 | 0.787 | 0.882 |
| Feb 27, 2020 | 4.831 | 1.378 | 0.708 | 0.799 |
| Feb 28, 2020 | 4.91 | 1.378 | 0.685 | 0.784 |
| Mar 02, 2020 | 5 | 1.485 | 0.771 | 0.866 |
| Mar 03, 2020 | 4.826 | 1.41 | 0.718 | 0.814 |
| Mar 04, 2020 | 5.01 | 1.503 | 0.796 | 0.89 |
| Mar 05, 2020 | 4.915 | 1.426 | 0.732 | 0.826 |
| Mar 06, 2020 | 4.679 | 1.38 | 0.715 | 0.795 |
| Mar 09, 2020 | 4.208 | 1.207 | 0.581 | 0.659 |
| Mar 10, 2020 | 4.37 | 1.316 | 0.659 | 0.741 |
| Mar 11, 2020 | 4.068 | 1.207 | 0.562 | 0.656 |
| Mar 12, 2020 | 3.626 | 0.999 | 0.406 | 0.498 |
| Mar 13, 2020 | 3.872 | 1.186 | 0.537 | 0.637 |
| Mar 16, 2020 | 3.236 | 0.916 | 0.339 | 0.441 |
| Mar 17, 2020 | 3.557 | 1.036 | 0.408 | 0.527 |
| Mar 18, 2020 | 3.358 | 0.94 | 0.319 | 0.448 |
| Mar 19, 2020 | 3.638 | 0.985 | 0.332 | 0.455 |
| Mar 20, 2020 | 3.648 | 0.91 | 0.271 | 0.392 |
| Mar 23, 2020 | 3.746 | 0.904 | 0.233 | 0.351 |
| Mar 24, 2020 | 4.086 | 1.059 | 0.373 | 0.478 |
| Mar 25, 2020 | 4.056 | 1.05 | 0.406 | 0.495 |
| Mar 26, 2020 | 4.331 | 1.164 | 0.495 | 0.588 |
| Mar 27, 2020 | 4.193 | 1.082 | 0.435 | 0.535 |
| Mar 30, 2020 | 4.281 | 1.158 | 0.48 | 0.586 |
| Mar 31, 2020 | 4.147 | 1.137 | 0.453 | 0.561 |
| Apr 01, 2020 | 3.898 | 1.043 | 0.389 | 0.492 |
| Apr 02, 2020 | 3.829 | 1.078 | 0.42 | 0.526 |
| Apr 03, 2020 | 3.777 | 1.046 | 0.396 | 0.503 |
| Apr 06, 2020 | 4.102 | 1.196 | 0.504 | 0.609 |
| Apr 07, 2020 | 4.006 | 1.189 | 0.502 | 0.606 |
| Apr 08, 2020 | 4.272 | 1.246 | 0.554 | 0.661 |
| Apr 09, 2020 | 4.327 | 1.263 | 0.573 | 0.685 |
| Apr 13, 2020 | 4.396 | 1.274 | 0.551 | 0.668 |
| Apr 14, 2020 | 4.622 | 1.364 | 0.588 | 0.719 |
| Apr 15, 2020 | 4.636 | 1.33 | 0.558 | 0.681 |
| Apr 16, 2020 | 4.689 | 1.368 | 0.561 | 0.691 |
| Apr 17, 2020 | 4.845 | 1.401 | 0.607 | 0.736 |
| Apr 20, 2020 | 4.917 | 1.376 | 0.568 | 0.705 |
| Apr 21, 2020 | 4.651 | 1.294 | 0.526 | 0.653 |
| Apr 22, 2020 | 4.83 | 1.358 | 0.557 | 0.691 |
| Apr 23, 2020 | 4.831 | 1.358 | 0.559 | 0.69 |
| Apr 24, 2020 | 4.925 | 1.397 | 0.576 | 0.713 |
| Apr 27, 2020 | 5.058 | 1.423 | 0.6 | 0.738 |
| Apr 28, 2020 | 4.927 | 1.389 | 0.598 | 0.729 |
| Apr 29, 2020 | 5.13 | 1.474 | 0.633 | 0.775 |
| Apr 30, 2020 | 5.113 | 1.467 | 0.614 | 0.759 |
| May 01, 2020 | 4.932 | 1.388 | 0.573 | 0.71 |
| May 04, 2020 | 5.063 | 1.418 | 0.575 | 0.717 |
| May 05, 2020 | 5.227 | 1.445 | 0.584 | 0.732 |
| May 06, 2020 | 5.4 | 1.458 | 0.569 | 0.72 |
| May 07, 2020 | 5.817 | 1.492 | 0.583 | 0.74 |
| May 08, 2020 | 5.843 | 1.532 | 0.613 | 0.769 |
| May 11, 2020 | 5.993 | 1.551 | 0.606 | 0.77 |
| May 12, 2020 | 5.919 | 1.499 | 0.576 | 0.733 |
| May 13, 2020 | 5.829 | 1.46 | 0.541 | 0.703 |
| May 14, 2020 | 5.907 | 1.482 | 0.567 | 0.723 |
| May 15, 2020 | 6.079 | 1.502 | 0.57 | 0.729 |
| May 18, 2020 | 6.026 | 1.563 | 0.631 | 0.784 |
| May 19, 2020 | 6.104 | 1.549 | 0.605 | 0.765 |
| May 20, 2020 | 6.258 | 1.602 | 0.63 | 0.795 |
| May 21, 2020 | 6.253 | 1.577 | 0.623 | 0.781 |
| May 22, 2020 | 6.403 | 1.588 | 0.622 | 0.785 |
| May 26, 2020 | 6.293 | 1.593 | 0.657 | 0.807 |
| May 27, 2020 | 6.217 | 1.613 | 0.694 | 0.834 |
| May 28, 2020 | 6.281 | 1.6 | 0.684 | 0.83 |
| May 29, 2020 | 6.628 | 1.634 | 0.683 | 0.839 |
| Jun 01, 2020 | 6.876 | 1.651 | 0.689 | 0.845 |
| Jun 02, 2020 | 6.864 | 1.667 | 0.707 | 0.861 |
| Jun 03, 2020 | 6.901 | 1.688 | 0.742 | 0.886 |
| Jun 04, 2020 | 6.586 | 1.669 | 0.743 | 0.88 |
| Jun 05, 2020 | 6.55 | 1.724 | 0.798 | 0.929 |
| Jun 08, 2020 | 6.679 | 1.755 | 0.828 | 0.952 |
| Jun 09, 2020 | 6.601 | 1.763 | 0.808 | 0.937 |
| Jun 10, 2020 | 6.765 | 1.781 | 0.79 | 0.927 |
| Jun 11, 2020 | 6.402 | 1.635 | 0.666 | 0.813 |
| Jun 12, 2020 | 6.521 | 1.662 | 0.698 | 0.837 |
| Jun 15, 2020 | 6.768 | 1.7 | 0.708 | 0.852 |
| Jun 16, 2020 | 6.935 | 1.747 | 0.743 | 0.887 |
| Jun 17, 2020 | 7.003 | 1.751 | 0.732 | 0.88 |
| Jun 18, 2020 | 7.176 | 1.76 | 0.729 | 0.881 |
| Jun 19, 2020 | 7.146 | 1.761 | 0.715 | 0.871 |
| Jun 22, 2020 | 7.435 | 1.791 | 0.726 | 0.883 |
| Jun 23, 2020 | 7.417 | 1.812 | 0.734 | 0.891 |
| Jun 24, 2020 | 7.251 | 1.75 | 0.687 | 0.842 |
| Jun 25, 2020 | 7.462 | 1.78 | 0.707 | 0.862 |
| Jun 26, 2020 | 7.412 | 1.708 | 0.659 | 0.817 |
| Jun 29, 2020 | 7.244 | 1.741 | 0.697 | 0.844 |
| Jun 30, 2020 | 7.439 | 1.792 | 0.712 | 0.872 |
| Jul 01, 2020 | 7.71 | 1.819 | 0.706 | 0.882 |
| Jul 02, 2020 | 7.725 | 1.833 | 0.713 | 0.89 |
| Jul 06, 2020 | 7.761 | 1.896 | 0.743 | 0.92 |
| Jul 07, 2020 | 7.781 | 1.871 | 0.717 | 0.9 |
| Jul 08, 2020 | 8.1 | 1.912 | 0.728 | 0.914 |
| Jul 09, 2020 | 8.224 | 1.928 | 0.704 | 0.904 |
| Jul 10, 2020 | 8.056 | 1.947 | 0.729 | 0.924 |
| Jul 13, 2020 | 7.471 | 1.884 | 0.73 | 0.906 |
| Jul 14, 2020 | 7.506 | 1.911 | 0.767 | 0.931 |
| Jul 15, 2020 | 7.508 | 1.928 | 0.782 | 0.949 |
| Jul 16, 2020 | 7.347 | 1.907 | 0.773 | 0.942 |
| Jul 17, 2020 | 7.469 | 1.915 | 0.769 | 0.948 |
| Jul 20, 2020 | 7.924 | 1.989 | 0.769 | 0.964 |
| Jul 21, 2020 | 7.795 | 1.964 | 0.78 | 0.967 |
| Jul 22, 2020 | 7.793 | 1.972 | 0.791 | 0.978 |
| Jul 23, 2020 | 7.581 | 1.904 | 0.767 | 0.954 |
| Jul 24, 2020 | 7.446 | 1.876 | 0.755 | 0.942 |
| Jul 27, 2020 | 7.634 | 1.924 | 0.763 | 0.956 |
| Jul 28, 2020 | 7.578 | 1.887 | 0.749 | 0.944 |
| Jul 29, 2020 | 7.887 | 1.926 | 0.76 | 0.968 |
| Jul 30, 2020 | 7.971 | 1.939 | 0.745 | 0.96 |
| Jul 31, 2020 | 8.068 | 1.982 | 0.752 | 0.976 |
| Aug 03, 2020 | 8.345 | 2.026 | 0.768 | 0.99 |
| Aug 04, 2020 | 8.352 | 2.037 | 0.779 | 0.997 |
| Aug 05, 2020 | 8.376 | 2.053 | 0.804 | 1.01 |
| Aug 06, 2020 | 8.138 | 2.083 | 0.816 | 1.023 |
| Aug 07, 2020 | 7.703 | 2.056 | 0.819 | 1.024 |
| Aug 10, 2020 | 7.462 | 2.044 | 0.843 | 1.029 |
| Aug 11, 2020 | 7.331 | 1.993 | 0.836 | 1.013 |
| Aug 12, 2020 | 7.425 | 2.057 | 0.855 | 1.041 |
| Aug 13, 2020 | 7.649 | 2.065 | 0.85 | 1.037 |
| Aug 14, 2020 | 7.576 | 2.059 | 0.852 | 1.037 |
| Aug 17, 2020 | 7.758 | 2.089 | 0.846 | 1.042 |
| Aug 18, 2020 | 7.863 | 2.112 | 0.842 | 1.047 |
| Aug 19, 2020 | 7.847 | 2.094 | 0.836 | 1.038 |
| Aug 20, 2020 | 8.124 | 2.127 | 0.839 | 1.045 |
| Aug 21, 2020 | 7.991 | 2.14 | 0.852 | 1.052 |
| Aug 24, 2020 | 7.933 | 2.159 | 0.877 | 1.072 |
| Aug 25, 2020 | 8.074 | 2.183 | 0.873 | 1.08 |
| Aug 26, 2020 | 8.486 | 2.238 | 0.879 | 1.101 |
| Aug 27, 2020 | 8.498 | 2.227 | 0.889 | 1.104 |
| Aug 28, 2020 | 8.595 | 2.246 | 0.9 | 1.119 |
| Aug 31, 2020 | 8.687 | 2.268 | 0.885 | 1.114 |
| Sep 01, 2020 | 9.192 | 2.314 | 0.899 | 1.13 |
| Sep 02, 2020 | 9.117 | 2.346 | 0.93 | 1.163 |
| Sep 03, 2020 | 8.283 | 2.18 | 0.876 | 1.087 |
| Sep 04, 2020 | 7.92 | 2.14 | 0.865 | 1.07 |
| Sep 08, 2020 | 7.691 | 2.011 | 0.823 | 1.012 |
| Sep 09, 2020 | 7.891 | 2.092 | 0.853 | 1.053 |
| Sep 10, 2020 | 7.8 | 2.031 | 0.826 | 1.017 |
| Sep 11, 2020 | 7.621 | 2.013 | 0.834 | 1.018 |
| Sep 14, 2020 | 7.776 | 2.069 | 0.856 | 1.043 |
| Sep 15, 2020 | 7.853 | 2.106 | 0.856 | 1.054 |
| Sep 16, 2020 | 7.771 | 2.067 | 0.859 | 1.045 |
| Sep 17, 2020 | 7.655 | 2.028 | 0.85 | 1.027 |
| Sep 18, 2020 | 7.729 | 1.996 | 0.834 | 1.005 |
| Sep 21, 2020 | 7.988 | 1.992 | 0.8 | 0.982 |
| Sep 22, 2020 | 8.157 | 2.043 | 0.809 | 1.002 |
| Sep 23, 2020 | 7.937 | 1.951 | 0.775 | 0.955 |
| Sep 24, 2020 | 7.84 | 1.962 | 0.778 | 0.961 |
| Sep 25, 2020 | 8.135 | 2.029 | 0.802 | 0.992 |
| Sep 28, 2020 | 8.258 | 2.086 | 0.829 | 1.024 |
| Sep 29, 2020 | 8.265 | 2.077 | 0.82 | 1.014 |
| Sep 30, 2020 | 8.256 | 2.1 | 0.842 | 1.031 |
| Oct 01, 2020 | 8.456 | 2.144 | 0.844 | 1.042 |
| Oct 02, 2020 | 8.331 | 2.074 | 0.836 | 1.022 |
| Oct 05, 2020 | 8.496 | 2.145 | 0.866 | 1.059 |
| Oct 06, 2020 | 8.552 | 2.096 | 0.842 | 1.03 |
| Oct 07, 2020 | 8.834 | 2.154 | 0.877 | 1.065 |
| Oct 08, 2020 | 8.827 | 2.17 | 0.885 | 1.082 |
| Oct 09, 2020 | 9.114 | 2.214 | 0.895 | 1.1 |
| Oct 12, 2020 | 9.258 | 2.296 | 0.912 | 1.134 |
| Oct 13, 2020 | 9.408 | 2.293 | 0.902 | 1.121 |
| Oct 14, 2020 | 9.278 | 2.267 | 0.891 | 1.107 |
| Oct 15, 2020 | 9.196 | 2.251 | 0.889 | 1.104 |
| Oct 16, 2020 | 9.205 | 2.24 | 0.897 | 1.104 |
| Oct 19, 2020 | 9.141 | 2.186 | 0.87 | 1.07 |
| Oct 20, 2020 | 9.023 | 2.197 | 0.877 | 1.079 |
| Oct 21, 2020 | 8.809 | 2.188 | 0.871 | 1.075 |
| Oct 22, 2020 | 8.753 | 2.194 | 0.881 | 1.086 |
| Oct 23, 2020 | 8.853 | 2.205 | 0.879 | 1.093 |
| Oct 26, 2020 | 8.647 | 2.153 | 0.836 | 1.054 |
| Oct 27, 2020 | 8.743 | 2.173 | 0.821 | 1.048 |
| Oct 28, 2020 | 8.425 | 2.055 | 0.758 | 0.975 |
| Oct 29, 2020 | 8.406 | 2.105 | 0.768 | 0.999 |
| Oct 30, 2020 | 8.103 | 2.029 | 0.757 | 0.975 |
| Nov 02, 2020 | 7.999 | 2.041 | 0.785 | 0.999 |
| Nov 03, 2020 | 8.204 | 2.098 | 0.822 | 1.035 |
| Nov 04, 2020 | 8.772 | 2.217 | 0.846 | 1.08 |
| Nov 05, 2020 | 9.098 | 2.3 | 0.882 | 1.12 |
| Nov 06, 2020 | 9.108 | 2.302 | 0.878 | 1.119 |
| Nov 09, 2020 | 8.558 | 2.251 | 0.933 | 1.144 |
| Nov 10, 2020 | 8.323 | 2.207 | 0.951 | 1.141 |
| Nov 11, 2020 | 8.581 | 2.271 | 0.949 | 1.158 |
| Nov 12, 2020 | 8.644 | 2.25 | 0.928 | 1.136 |
| Nov 13, 2020 | 8.587 | 2.283 | 0.955 | 1.165 |
| Nov 16, 2020 | 8.555 | 2.31 | 0.986 | 1.19 |
| Nov 17, 2020 | 8.719 | 2.303 | 0.975 | 1.18 |
| Nov 18, 2020 | 8.67 | 2.276 | 0.952 | 1.155 |
| Nov 19, 2020 | 8.908 | 2.304 | 0.955 | 1.163 |
| Nov 20, 2020 | 9.006 | 2.291 | 0.94 | 1.149 |
| Nov 23, 2020 | 9.047 | 2.298 | 0.962 | 1.161 |
| Nov 24, 2020 | 8.983 | 2.341 | 0.992 | 1.196 |
| Nov 25, 2020 | 9.307 | 2.357 | 0.981 | 1.192 |
| Nov 27, 2020 | 9.514 | 2.388 | 0.983 | 1.197 |
| Nov 30, 2020 | 9.618 | 2.386 | 0.965 | 1.187 |
| Dec 01, 2020 | 9.499 | 2.429 | 0.978 | 1.212 |
| Dec 02, 2020 | 9.397 | 2.428 | 0.981 | 1.216 |
| Dec 03, 2020 | 9.615 | 2.435 | 0.987 | 1.214 |
| Dec 04, 2020 | 9.734 | 2.46 | 1.004 | 1.234 |
| Dec 07, 2020 | 9.823 | 2.475 | 0.994 | 1.23 |
| Dec 08, 2020 | 9.979 | 2.493 | 1.001 | 1.236 |
| Dec 09, 2020 | 9.634 | 2.425 | 0.994 | 1.218 |
| Dec 10, 2020 | 9.967 | 2.443 | 0.989 | 1.215 |
| Dec 11, 2020 | 10.005 | 2.436 | 0.992 | 1.212 |
| Dec 14, 2020 | 10.159 | 2.453 | 0.98 | 1.203 |
| Dec 15, 2020 | 10.189 | 2.496 | 1.002 | 1.231 |
| Dec 16, 2020 | 10.386 | 2.513 | 0.999 | 1.235 |
| Dec 17, 2020 | 10.693 | 2.543 | 1.009 | 1.248 |
| Dec 18, 2020 | 10.896 | 2.54 | 1.001 | 1.24 |
| Dec 21, 2020 | 11.001 | 2.537 | 1.004 | 1.231 |
| Dec 22, 2020 | 11.407 | 2.555 | 0.99 | 1.227 |
| Dec 23, 2020 | 11.177 | 2.545 | 0.998 | 1.229 |
| Dec 24, 2020 | 11.158 | 2.554 | 1.002 | 1.236 |
| Dec 28, 2020 | 10.831 | 2.58 | 1.016 | 1.256 |
| Dec 29, 2020 | 10.654 | 2.567 | 1.011 | 1.251 |
| Dec 30, 2020 | 10.701 | 2.572 | 1.016 | 1.254 |
| Dec 31, 2020 | 10.619 | 2.577 | 1.029 | 1.268 |
| Jan 04, 2021 | 10.42 | 2.525 | 1.004 | 1.235 |
| Jan 05, 2021 | 10.517 | 2.558 | 1.015 | 1.251 |
| Jan 06, 2021 | 10.166 | 2.536 | 1.044 | 1.264 |
| Jan 07, 2021 | 10.609 | 2.627 | 1.058 | 1.297 |
| Jan 08, 2021 | 10.872 | 2.664 | 1.062 | 1.31 |
| Jan 11, 2021 | 10.777 | 2.618 | 1.056 | 1.295 |
| Jan 12, 2021 | 10.849 | 2.628 | 1.06 | 1.296 |
| Jan 13, 2021 | 10.824 | 2.644 | 1.06 | 1.301 |
| Jan 14, 2021 | 10.842 | 2.64 | 1.055 | 1.292 |
| Jan 15, 2021 | 10.709 | 2.608 | 1.043 | 1.276 |
| Jan 19, 2021 | 10.946 | 2.663 | 1.051 | 1.294 |
| Jan 20, 2021 | 11.141 | 2.735 | 1.068 | 1.326 |
| Jan 21, 2021 | 11.102 | 2.756 | 1.067 | 1.327 |
| Jan 22, 2021 | 11.187 | 2.759 | 1.055 | 1.32 |
| Jan 25, 2021 | 11.047 | 2.785 | 1.053 | 1.328 |
| Jan 26, 2021 | 10.756 | 2.782 | 1.051 | 1.325 |
| Jan 27, 2021 | 10.503 | 2.683 | 1.009 | 1.265 |
| Jan 28, 2021 | 10.812 | 2.702 | 1.029 | 1.287 |
| Jan 29, 2021 | 10.676 | 2.628 | 0.988 | 1.243 |
| Feb 01, 2021 | 10.926 | 2.72 | 1.003 | 1.279 |
| Feb 02, 2021 | 11.327 | 2.778 | 1.035 | 1.311 |
| Feb 03, 2021 | 11.239 | 2.778 | 1.037 | 1.313 |
| Feb 04, 2021 | 11.503 | 2.824 | 1.059 | 1.338 |
| Feb 05, 2021 | 11.74 | 2.846 | 1.065 | 1.347 |
| Feb 08, 2021 | 11.834 | 2.882 | 1.081 | 1.365 |
| Feb 09, 2021 | 11.979 | 2.888 | 1.08 | 1.362 |
| Feb 10, 2021 | 11.994 | 2.878 | 1.085 | 1.361 |
| Feb 11, 2021 | 12.044 | 2.893 | 1.084 | 1.365 |
| Feb 12, 2021 | 12.127 | 2.912 | 1.086 | 1.376 |
| Feb 16, 2021 | 11.961 | 2.899 | 1.09 | 1.375 |
| Feb 17, 2021 | 11.808 | 2.876 | 1.096 | 1.374 |
| Feb 18, 2021 | 11.834 | 2.849 | 1.088 | 1.364 |
| Feb 19, 2021 | 11.979 | 2.851 | 1.088 | 1.359 |
| Feb 22, 2021 | 11.29 | 2.756 | 1.09 | 1.341 |
| Feb 23, 2021 | 11.049 | 2.737 | 1.091 | 1.344 |
| Feb 24, 2021 | 11.174 | 2.774 | 1.119 | 1.371 |
| Feb 25, 2021 | 10.533 | 2.641 | 1.082 | 1.313 |
| Feb 26, 2021 | 10.57 | 2.662 | 1.051 | 1.302 |
| Mar 01, 2021 | 11.018 | 2.772 | 1.091 | 1.356 |
| Mar 02, 2021 | 10.666 | 2.708 | 1.081 | 1.337 |
| Mar 03, 2021 | 10.023 | 2.608 | 1.073 | 1.307 |
| Mar 04, 2021 | 9.586 | 2.532 | 1.05 | 1.276 |
| Mar 05, 2021 | 9.539 | 2.586 | 1.088 | 1.32 |
| Mar 08, 2021 | 9.062 | 2.5 | 1.109 | 1.308 |
| Mar 09, 2021 | 9.752 | 2.629 | 1.111 | 1.34 |
| Mar 10, 2021 | 9.636 | 2.627 | 1.142 | 1.355 |
| Mar 11, 2021 | 10.167 | 2.719 | 1.154 | 1.379 |
| Mar 12, 2021 | 10.003 | 2.697 | 1.173 | 1.381 |
| Mar 15, 2021 | 10.133 | 2.736 | 1.185 | 1.397 |
| Mar 16, 2021 | 9.983 | 2.739 | 1.177 | 1.393 |
| Mar 17, 2021 | 10 | 2.754 | 1.189 | 1.4 |
| Mar 18, 2021 | 9.433 | 2.641 | 1.179 | 1.365 |
| Mar 19, 2021 | 9.61 | 2.668 | 1.163 | 1.363 |
| Mar 22, 2021 | 9.817 | 2.713 | 1.17 | 1.38 |
| Mar 23, 2021 | 9.769 | 2.672 | 1.15 | 1.362 |
| Mar 24, 2021 | 9.258 | 2.598 | 1.15 | 1.349 |
| Mar 25, 2021 | 9.246 | 2.602 | 1.163 | 1.361 |
| Mar 26, 2021 | 9.343 | 2.647 | 1.193 | 1.4 |
| Mar 29, 2021 | 9.057 | 2.625 | 1.199 | 1.398 |
| Mar 30, 2021 | 9.086 | 2.621 | 1.193 | 1.391 |
| Mar 31, 2021 | 9.455 | 2.677 | 1.187 | 1.399 |
| Apr 01, 2021 | 9.769 | 2.742 | 1.198 | 1.428 |
| Apr 05, 2021 | 9.759 | 2.804 | 1.223 | 1.463 |
| Apr 06, 2021 | 9.914 | 2.802 | 1.217 | 1.46 |
| Apr 07, 2021 | 9.788 | 2.8 | 1.218 | 1.464 |
| Apr 08, 2021 | 10.057 | 2.839 | 1.222 | 1.474 |
| Apr 09, 2021 | 10.028 | 2.858 | 1.241 | 1.493 |
| Apr 12, 2021 | 10.053 | 2.844 | 1.238 | 1.493 |
| Apr 13, 2021 | 10.37 | 2.885 | 1.233 | 1.501 |
| Apr 14, 2021 | 10.218 | 2.846 | 1.237 | 1.491 |
| Apr 15, 2021 | 10.445 | 2.897 | 1.257 | 1.519 |
| Apr 16, 2021 | 10.31 | 2.9 | 1.268 | 1.528 |
| Apr 19, 2021 | 10.056 | 2.862 | 1.26 | 1.514 |
| Apr 20, 2021 | 9.848 | 2.827 | 1.243 | 1.497 |
| Apr 21, 2021 | 9.997 | 2.872 | 1.264 | 1.52 |
| Apr 22, 2021 | 10.087 | 2.835 | 1.242 | 1.497 |
| Apr 23, 2021 | 10.283 | 2.891 | 1.257 | 1.525 |
| Apr 26, 2021 | 10.661 | 2.924 | 1.253 | 1.529 |
| Apr 27, 2021 | 10.581 | 2.911 | 1.253 | 1.528 |
| Apr 28, 2021 | 10.598 | 2.9 | 1.243 | 1.526 |
| Apr 29, 2021 | 10.302 | 2.909 | 1.258 | 1.543 |
| May 03, 2021 | 9.87 | 2.857 | 1.262 | 1.532 |
| May 04, 2021 | 9.486 | 2.784 | 1.263 | 1.515 |
| May 05, 2021 | 9.352 | 2.77 | 1.27 | 1.517 |
| May 06, 2021 | 9.061 | 2.784 | 1.291 | 1.537 |
| May 07, 2021 | 9.211 | 2.817 | 1.306 | 1.556 |
| May 10, 2021 | 8.957 | 2.72 | 1.304 | 1.53 |
| May 11, 2021 | 9.182 | 2.716 | 1.272 | 1.508 |
| May 12, 2021 | 8.816 | 2.617 | 1.227 | 1.454 |
| May 13, 2021 | 8.678 | 2.643 | 1.256 | 1.484 |
| May 14, 2021 | 9.028 | 2.728 | 1.28 | 1.521 |
| May 17, 2021 | 8.948 | 2.714 | 1.276 | 1.514 |
| May 18, 2021 | 9.08 | 2.693 | 1.258 | 1.493 |
| May 19, 2021 | 9.083 | 2.692 | 1.248 | 1.486 |
| May 20, 2021 | 9.382 | 2.757 | 1.26 | 1.512 |
| May 21, 2021 | 9.4 | 2.739 | 1.268 | 1.51 |
| May 24, 2021 | 9.553 | 2.792 | 1.281 | 1.535 |
| May 25, 2021 | 9.553 | 2.791 | 1.275 | 1.529 |
| May 26, 2021 | 9.739 | 2.813 | 1.276 | 1.534 |
| May 27, 2021 | 9.708 | 2.813 | 1.285 | 1.537 |
| May 28, 2021 | 9.768 | 2.816 | 1.29 | 1.539 |
| Jun 01, 2021 | 9.717 | 2.813 | 1.293 | 1.538 |
| Jun 02, 2021 | 9.778 | 2.818 | 1.294 | 1.541 |
| Jun 03, 2021 | 9.572 | 2.779 | 1.293 | 1.532 |
| Jun 04, 2021 | 9.718 | 2.834 | 1.305 | 1.555 |
| Jun 07, 2021 | 9.911 | 2.853 | 1.296 | 1.553 |
| Jun 08, 2021 | 10.034 | 2.865 | 1.294 | 1.553 |
| Jun 09, 2021 | 9.981 | 2.861 | 1.284 | 1.548 |
| Jun 10, 2021 | 10.238 | 2.892 | 1.285 | 1.56 |
| Jun 11, 2021 | 10.425 | 2.905 | 1.286 | 1.565 |
| Jun 14, 2021 | 10.562 | 2.934 | 1.281 | 1.57 |
| Jun 15, 2021 | 10.39 | 2.906 | 1.274 | 1.565 |
| Jun 16, 2021 | 10.486 | 2.897 | 1.257 | 1.551 |
| Jun 18, 2021 | 11.032 | 2.894 | 1.207 | 1.516 |
| Jun 21, 2021 | 11.032 | 2.925 | 1.246 | 1.551 |
| Jun 22, 2021 | 11.155 | 2.956 | 1.251 | 1.565 |
| Jun 23, 2021 | 11.232 | 2.961 | 1.246 | 1.562 |
| Jun 24, 2021 | 11.317 | 2.989 | 1.267 | 1.577 |
| Jun 25, 2021 | 11.307 | 2.986 | 1.283 | 1.585 |
| Jun 28, 2021 | 11.399 | 3.025 | 1.273 | 1.591 |
| Jun 29, 2021 | 11.423 | 3.033 | 1.274 | 1.592 |
| Jun 30, 2021 | 11.162 | 3.026 | 1.288 | 1.595 |
| Jul 01, 2021 | 11.155 | 3.031 | 1.296 | 1.609 |
| Jul 02, 2021 | 11.266 | 3.063 | 1.307 | 1.628 |
| Jul 06, 2021 | 11.512 | 3.07 | 1.293 | 1.623 |
| Jul 07, 2021 | 11.472 | 3.07 | 1.3 | 1.632 |
| Jul 08, 2021 | 11.359 | 3.041 | 1.282 | 1.609 |
| Jul 09, 2021 | 11.486 | 3.081 | 1.312 | 1.639 |
| Jul 12, 2021 | 11.34 | 3.089 | 1.32 | 1.648 |
| Jul 13, 2021 | 11.265 | 3.074 | 1.313 | 1.639 |
| Jul 14, 2021 | 11.002 | 3.065 | 1.316 | 1.642 |
| Jul 15, 2021 | 10.809 | 3.037 | 1.32 | 1.633 |
| Jul 16, 2021 | 10.866 | 3.004 | 1.3 | 1.613 |
| Jul 19, 2021 | 10.948 | 2.962 | 1.252 | 1.572 |
| Jul 20, 2021 | 11.259 | 3.024 | 1.288 | 1.611 |
| Jul 21, 2021 | 11.411 | 3.061 | 1.307 | 1.632 |
| Jul 22, 2021 | 11.56 | 3.076 | 1.309 | 1.638 |
| Jul 23, 2021 | 11.659 | 3.118 | 1.325 | 1.664 |
| Jul 26, 2021 | 11.603 | 3.119 | 1.33 | 1.671 |
| Jul 27, 2021 | 11.364 | 3.069 | 1.325 | 1.658 |